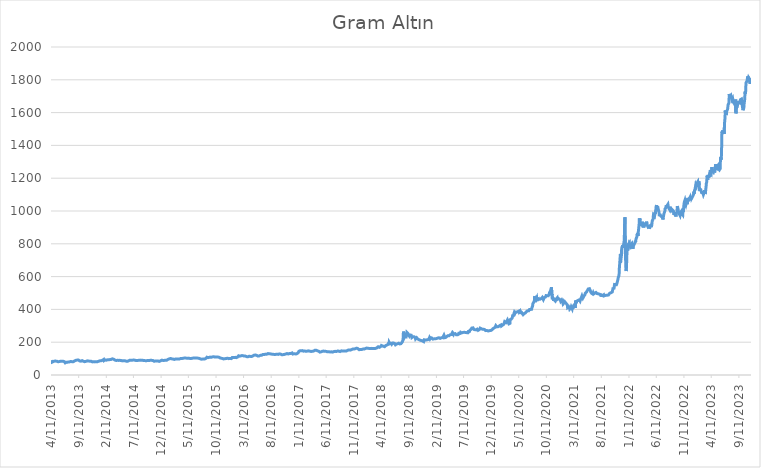
| Category | Açılış |
|---|---|
| 4/11/13 | 89.632 |
| 4/12/13 | 89.523 |
| 4/15/13 | 85.161 |
| 4/16/13 | 77.945 |
| 4/17/13 | 78.718 |
| 4/18/13 | 79.491 |
| 4/19/13 | 80.335 |
| 4/22/13 | 81.449 |
| 4/23/13 | 82.692 |
| 4/24/13 | 81.915 |
| 4/25/13 | 82.908 |
| 4/26/13 | 84.806 |
| 4/29/13 | 84.578 |
| 4/30/13 | 85.11 |
| 5/1/13 | 84.945 |
| 5/2/13 | 83.949 |
| 5/3/13 | 84.479 |
| 5/6/13 | 84.735 |
| 5/7/13 | 84.812 |
| 5/8/13 | 83.806 |
| 5/9/13 | 84.729 |
| 5/10/13 | 84.164 |
| 5/13/13 | 83.9 |
| 5/14/13 | 83.254 |
| 5/15/13 | 83.142 |
| 5/16/13 | 81.625 |
| 5/17/13 | 81.239 |
| 5/20/13 | 80.635 |
| 5/21/13 | 82.519 |
| 5/22/13 | 81.223 |
| 5/23/13 | 81.29 |
| 5/24/13 | 82.362 |
| 5/27/13 | 82.265 |
| 5/28/13 | 82.569 |
| 5/29/13 | 82.46 |
| 5/30/13 | 83.274 |
| 5/31/13 | 85.065 |
| 6/3/13 | 84.077 |
| 6/4/13 | 85.318 |
| 6/5/13 | 84.267 |
| 6/6/13 | 85.198 |
| 6/7/13 | 85.844 |
| 6/10/13 | 83.459 |
| 6/11/13 | 84.649 |
| 6/12/13 | 83.728 |
| 6/13/13 | 83.563 |
| 6/14/13 | 82.855 |
| 6/17/13 | 83.852 |
| 6/18/13 | 83.323 |
| 6/19/13 | 82.851 |
| 6/20/13 | 82.698 |
| 6/21/13 | 79.638 |
| 6/24/13 | 80.744 |
| 6/25/13 | 80.178 |
| 6/26/13 | 79.251 |
| 6/27/13 | 76.233 |
| 6/28/13 | 74.018 |
| 7/1/13 | 76.478 |
| 7/2/13 | 77.438 |
| 7/3/13 | 77.248 |
| 7/4/13 | 78.277 |
| 7/5/13 | 77.976 |
| 7/8/13 | 77.012 |
| 7/9/13 | 77.377 |
| 7/10/13 | 77.937 |
| 7/11/13 | 78.868 |
| 7/12/13 | 80.626 |
| 7/15/13 | 80.668 |
| 7/16/13 | 79.656 |
| 7/17/13 | 79.631 |
| 7/18/13 | 78.232 |
| 7/19/13 | 79.237 |
| 7/22/13 | 79.856 |
| 7/23/13 | 81.944 |
| 7/24/13 | 82.308 |
| 7/25/13 | 81.533 |
| 7/26/13 | 82.352 |
| 7/29/13 | 82.478 |
| 7/30/13 | 82.231 |
| 7/31/13 | 81.974 |
| 8/1/13 | 82.221 |
| 8/2/13 | 81.754 |
| 8/5/13 | 81.188 |
| 8/6/13 | 80.844 |
| 8/7/13 | 79.278 |
| 8/8/13 | 79.811 |
| 8/9/13 | 81.027 |
| 8/12/13 | 81.09 |
| 8/13/13 | 82.784 |
| 8/14/13 | 82.051 |
| 8/15/13 | 82.373 |
| 8/16/13 | 84.738 |
| 8/19/13 | 85.996 |
| 8/20/13 | 85.76 |
| 8/21/13 | 85.887 |
| 8/22/13 | 87.004 |
| 8/23/13 | 88.097 |
| 8/26/13 | 89.387 |
| 8/27/13 | 90.05 |
| 8/28/13 | 92.638 |
| 8/29/13 | 92.826 |
| 8/30/13 | 91.961 |
| 9/2/13 | 90.925 |
| 9/3/13 | 90.255 |
| 9/4/13 | 93.319 |
| 9/5/13 | 91.66 |
| 9/6/13 | 90.864 |
| 9/9/13 | 91.605 |
| 9/10/13 | 90.268 |
| 9/11/13 | 88.229 |
| 9/12/13 | 88.248 |
| 9/13/13 | 86.101 |
| 9/16/13 | 85.794 |
| 9/17/13 | 84.303 |
| 9/18/13 | 84.209 |
| 9/19/13 | 85.167 |
| 9/20/13 | 86.058 |
| 9/23/13 | 84.267 |
| 9/24/13 | 84.248 |
| 9/25/13 | 84.872 |
| 9/26/13 | 86.345 |
| 9/27/13 | 85.987 |
| 9/30/13 | 87.858 |
| 10/1/13 | 86.049 |
| 10/2/13 | 83.077 |
| 10/3/13 | 84.28 |
| 10/4/13 | 84.711 |
| 10/7/13 | 83.704 |
| 10/8/13 | 84.67 |
| 10/9/13 | 84.287 |
| 10/10/13 | 83.111 |
| 10/11/13 | 81.566 |
| 10/14/13 | 81.306 |
| 10/15/13 | 80.933 |
| 10/16/13 | 81.688 |
| 10/17/13 | 81.136 |
| 10/18/13 | 83.309 |
| 10/21/13 | 83.226 |
| 10/22/13 | 83.667 |
| 10/23/13 | 84.637 |
| 10/24/13 | 84.454 |
| 10/25/13 | 85.646 |
| 10/28/13 | 86.206 |
| 10/29/13 | 86.219 |
| 10/30/13 | 85.905 |
| 10/31/13 | 86.037 |
| 11/1/13 | 84.839 |
| 11/4/13 | 85.101 |
| 11/5/13 | 85.066 |
| 11/6/13 | 85.534 |
| 11/7/13 | 86.127 |
| 11/8/13 | 85.488 |
| 11/11/13 | 84.266 |
| 11/12/13 | 84.102 |
| 11/13/13 | 83.543 |
| 11/14/13 | 84.122 |
| 11/15/13 | 84.19 |
| 11/18/13 | 84.115 |
| 11/19/13 | 82.851 |
| 11/20/13 | 82.357 |
| 11/21/13 | 80.457 |
| 11/22/13 | 80.51 |
| 11/25/13 | 80.031 |
| 11/26/13 | 80.661 |
| 11/27/13 | 80.241 |
| 11/28/13 | 80.514 |
| 11/29/13 | 80.498 |
| 12/2/13 | 81.146 |
| 12/3/13 | 79.936 |
| 12/4/13 | 80.303 |
| 12/5/13 | 81.77 |
| 12/6/13 | 80.262 |
| 12/9/13 | 80.062 |
| 12/10/13 | 80.892 |
| 12/11/13 | 82.084 |
| 12/12/13 | 82.166 |
| 12/13/13 | 80.41 |
| 12/16/13 | 81.168 |
| 12/17/13 | 80.771 |
| 12/18/13 | 80.475 |
| 12/19/13 | 80.485 |
| 12/20/13 | 79.066 |
| 12/23/13 | 80.781 |
| 12/24/13 | 80.764 |
| 12/26/13 | 81.153 |
| 12/27/13 | 82.712 |
| 12/30/13 | 84.058 |
| 12/31/13 | 81.552 |
| 1/2/14 | 82.973 |
| 1/3/14 | 85.194 |
| 1/6/14 | 86.462 |
| 1/7/14 | 86.278 |
| 1/8/14 | 85.723 |
| 1/9/14 | 86.011 |
| 1/10/14 | 85.847 |
| 1/13/14 | 86.711 |
| 1/14/14 | 87.718 |
| 1/15/14 | 87.316 |
| 1/16/14 | 87.404 |
| 1/17/14 | 88.086 |
| 1/20/14 | 89.911 |
| 1/21/14 | 90.304 |
| 1/22/14 | 89.759 |
| 1/23/14 | 89.692 |
| 1/24/14 | 93.03 |
| 1/27/14 | 95.079 |
| 1/28/14 | 92.067 |
| 1/29/14 | 87.918 |
| 1/30/14 | 92.052 |
| 1/31/14 | 90.283 |
| 2/3/14 | 90.271 |
| 2/4/14 | 92.183 |
| 2/5/14 | 90.042 |
| 2/6/14 | 90.363 |
| 2/7/14 | 89.206 |
| 2/10/14 | 90.21 |
| 2/11/14 | 90.614 |
| 2/12/14 | 90.856 |
| 2/13/14 | 90.77 |
| 2/14/14 | 91.325 |
| 2/17/14 | 92.418 |
| 2/18/14 | 92.883 |
| 2/19/14 | 92.55 |
| 2/20/14 | 93.188 |
| 2/21/14 | 93.468 |
| 2/24/14 | 92.723 |
| 2/25/14 | 94.526 |
| 2/26/14 | 95.271 |
| 2/27/14 | 95.642 |
| 2/28/14 | 94.718 |
| 3/2/14 | 94.147 |
| 3/3/14 | 95.887 |
| 3/4/14 | 96.796 |
| 3/5/14 | 94.769 |
| 3/6/14 | 94.663 |
| 3/7/14 | 94.597 |
| 3/9/14 | 95.046 |
| 3/10/14 | 94.882 |
| 3/11/14 | 95.651 |
| 3/12/14 | 97.273 |
| 3/13/14 | 98.137 |
| 3/14/14 | 98.687 |
| 3/16/14 | 98.708 |
| 3/17/14 | 99.093 |
| 3/18/14 | 97.545 |
| 3/19/14 | 96.716 |
| 3/20/14 | 95.734 |
| 3/21/14 | 95.512 |
| 3/23/14 | 96.329 |
| 3/24/14 | 95.827 |
| 3/25/14 | 94.295 |
| 3/26/14 | 93.356 |
| 3/27/14 | 92.045 |
| 3/28/14 | 90.834 |
| 3/30/14 | 91.045 |
| 3/31/14 | 90.744 |
| 4/1/14 | 88.322 |
| 4/2/14 | 88.014 |
| 4/3/14 | 88.326 |
| 4/4/14 | 88.184 |
| 4/6/14 | 88.638 |
| 4/7/14 | 88.674 |
| 4/8/14 | 88.174 |
| 4/9/14 | 88.225 |
| 4/10/14 | 88.606 |
| 4/11/14 | 89.501 |
| 4/13/14 | 89.585 |
| 4/14/14 | 90.324 |
| 4/15/14 | 90.449 |
| 4/16/14 | 89.772 |
| 4/17/14 | 89.539 |
| 4/20/14 | 89.003 |
| 4/21/14 | 88.498 |
| 4/22/14 | 88.476 |
| 4/23/14 | 88.503 |
| 4/24/14 | 88.82 |
| 4/25/14 | 88.647 |
| 4/27/14 | 89.41 |
| 4/28/14 | 89.593 |
| 4/29/14 | 88.725 |
| 4/30/14 | 88.401 |
| 5/1/14 | 87.727 |
| 5/2/14 | 86.989 |
| 5/4/14 | 88.07 |
| 5/5/14 | 88.006 |
| 5/6/14 | 88.535 |
| 5/7/14 | 87.848 |
| 5/8/14 | 86.355 |
| 5/9/14 | 86.198 |
| 5/11/14 | 86.114 |
| 5/12/14 | 85.712 |
| 5/13/14 | 86.74 |
| 5/14/14 | 86.136 |
| 5/15/14 | 86.937 |
| 5/16/14 | 87.491 |
| 5/18/14 | 87.248 |
| 5/19/14 | 87.127 |
| 5/20/14 | 87.183 |
| 5/21/14 | 87.965 |
| 5/22/14 | 87.08 |
| 5/23/14 | 86.622 |
| 5/25/14 | 86.465 |
| 5/26/14 | 86.441 |
| 5/27/14 | 86.548 |
| 5/28/14 | 85.398 |
| 5/29/14 | 84.821 |
| 5/30/14 | 84.38 |
| 6/1/14 | 84.244 |
| 6/2/14 | 84.1 |
| 6/3/14 | 84.391 |
| 6/4/14 | 84.797 |
| 6/5/14 | 84.637 |
| 6/6/14 | 84.525 |
| 6/8/14 | 83.664 |
| 6/9/14 | 83.75 |
| 6/10/14 | 83.974 |
| 6/11/14 | 84.234 |
| 6/12/14 | 85.739 |
| 6/13/14 | 86.482 |
| 6/15/14 | 87.308 |
| 6/16/14 | 87.354 |
| 6/17/14 | 87.693 |
| 6/18/14 | 87.85 |
| 6/19/14 | 87.358 |
| 6/20/14 | 90.531 |
| 6/22/14 | 90.635 |
| 6/23/14 | 90.681 |
| 6/24/14 | 90.25 |
| 6/25/14 | 90.814 |
| 6/26/14 | 90.358 |
| 6/27/14 | 89.952 |
| 6/29/14 | 89.852 |
| 6/30/14 | 89.818 |
| 7/1/14 | 90.343 |
| 7/2/14 | 90.729 |
| 7/3/14 | 90.785 |
| 7/4/14 | 90.318 |
| 7/6/14 | 90.59 |
| 7/7/14 | 90.351 |
| 7/8/14 | 90.239 |
| 7/9/14 | 90.059 |
| 7/10/14 | 90.269 |
| 7/11/14 | 91.225 |
| 7/13/14 | 91.253 |
| 7/14/14 | 91.268 |
| 7/15/14 | 89.092 |
| 7/16/14 | 88.442 |
| 7/17/14 | 88.609 |
| 7/18/14 | 90.845 |
| 7/20/14 | 89.58 |
| 7/21/14 | 89.561 |
| 7/22/14 | 89.317 |
| 7/23/14 | 88.599 |
| 7/24/14 | 87.555 |
| 7/25/14 | 86.988 |
| 7/27/14 | 87.967 |
| 7/28/14 | 87.926 |
| 7/29/14 | 88.012 |
| 7/30/14 | 88.339 |
| 7/31/14 | 88.907 |
| 8/1/14 | 88.354 |
| 8/3/14 | 88.676 |
| 8/4/14 | 88.718 |
| 8/5/14 | 88.251 |
| 8/6/14 | 89.182 |
| 8/7/14 | 90.702 |
| 8/8/14 | 91.468 |
| 8/11/14 | 89.862 |
| 8/12/14 | 90.402 |
| 8/13/14 | 91.055 |
| 8/14/14 | 90.927 |
| 8/15/14 | 90.906 |
| 8/17/14 | 90.726 |
| 8/18/14 | 90.737 |
| 8/19/14 | 90.302 |
| 8/20/14 | 90.075 |
| 8/21/14 | 90.595 |
| 8/22/14 | 89.476 |
| 8/24/14 | 89.602 |
| 8/25/14 | 89.563 |
| 8/26/14 | 89.416 |
| 8/27/14 | 89.206 |
| 8/28/14 | 88.913 |
| 8/29/14 | 89.65 |
| 8/31/14 | 89.455 |
| 9/1/14 | 89.407 |
| 9/2/14 | 89.326 |
| 9/3/14 | 88.527 |
| 9/4/14 | 88.123 |
| 9/5/14 | 87.587 |
| 9/7/14 | 88.042 |
| 9/8/14 | 87.93 |
| 9/9/14 | 87.768 |
| 9/10/14 | 88.617 |
| 9/11/14 | 88.058 |
| 9/12/14 | 87.746 |
| 9/14/14 | 87.49 |
| 9/15/14 | 87.746 |
| 9/16/14 | 87.794 |
| 9/17/14 | 87.521 |
| 9/18/14 | 87.37 |
| 9/19/14 | 87.645 |
| 9/21/14 | 87.383 |
| 9/22/14 | 87.399 |
| 9/23/14 | 87.54 |
| 9/24/14 | 87.914 |
| 9/25/14 | 87.472 |
| 9/26/14 | 88.882 |
| 9/28/14 | 88.71 |
| 9/29/14 | 88.589 |
| 9/30/14 | 89.171 |
| 10/1/14 | 88.508 |
| 10/2/14 | 89.23 |
| 10/3/14 | 88.467 |
| 10/5/14 | 87.777 |
| 10/6/14 | 87.497 |
| 10/7/14 | 88.003 |
| 10/8/14 | 88.532 |
| 10/9/14 | 88.762 |
| 10/10/14 | 89.328 |
| 10/12/14 | 89.962 |
| 10/13/14 | 90.461 |
| 10/14/14 | 90.223 |
| 10/15/14 | 89.869 |
| 10/16/14 | 90.565 |
| 10/17/14 | 90.077 |
| 10/19/14 | 89.425 |
| 10/20/14 | 89.18 |
| 10/21/14 | 89.868 |
| 10/22/14 | 90.113 |
| 10/23/14 | 89.753 |
| 10/24/14 | 88.523 |
| 10/26/14 | 88.295 |
| 10/27/14 | 88.145 |
| 10/28/14 | 87.918 |
| 10/29/14 | 87.225 |
| 10/30/14 | 86.386 |
| 10/31/14 | 84.865 |
| 11/2/14 | 83.881 |
| 11/3/14 | 83.544 |
| 11/4/14 | 83.718 |
| 11/5/14 | 83.518 |
| 11/6/14 | 82.551 |
| 11/7/14 | 83.115 |
| 11/9/14 | 85.347 |
| 11/10/14 | 84.962 |
| 11/11/14 | 83.931 |
| 11/12/14 | 84.298 |
| 11/13/14 | 83.895 |
| 11/14/14 | 83.703 |
| 11/16/14 | 84.976 |
| 11/17/14 | 84.785 |
| 11/18/14 | 85.111 |
| 11/19/14 | 85.348 |
| 11/20/14 | 84.889 |
| 11/21/14 | 85.217 |
| 11/23/14 | 85.85 |
| 11/24/14 | 85.869 |
| 11/25/14 | 85.855 |
| 11/26/14 | 85.732 |
| 11/27/14 | 85.126 |
| 11/28/14 | 84.407 |
| 11/30/14 | 82.839 |
| 12/1/14 | 82.223 |
| 12/2/14 | 85.891 |
| 12/3/14 | 85.92 |
| 12/4/14 | 87.032 |
| 12/5/14 | 86.545 |
| 12/7/14 | 86.479 |
| 12/8/14 | 86.405 |
| 12/9/14 | 87.734 |
| 12/10/14 | 89.566 |
| 12/11/14 | 89.561 |
| 12/12/14 | 89.911 |
| 12/14/14 | 90.575 |
| 12/15/14 | 90.523 |
| 12/16/14 | 90.795 |
| 12/17/14 | 90.997 |
| 12/18/14 | 89.461 |
| 12/19/14 | 89.422 |
| 12/21/14 | 88.849 |
| 12/22/14 | 88.959 |
| 12/23/14 | 87.372 |
| 12/24/14 | 87.948 |
| 12/25/14 | 87.779 |
| 12/26/14 | 87.762 |
| 12/28/14 | 89.146 |
| 12/29/14 | 89.069 |
| 12/30/14 | 88.095 |
| 12/31/14 | 89.747 |
| 1/1/15 | 88.858 |
| 1/2/15 | 89.038 |
| 1/4/15 | 89.461 |
| 1/5/15 | 89.241 |
| 1/6/15 | 90.204 |
| 1/7/15 | 90.958 |
| 1/8/15 | 90.397 |
| 1/9/15 | 89.32 |
| 1/11/15 | 90.287 |
| 1/12/15 | 90.424 |
| 1/13/15 | 90.471 |
| 1/14/15 | 90.537 |
| 1/15/15 | 90.343 |
| 1/16/15 | 93.661 |
| 1/18/15 | 95.585 |
| 1/19/15 | 95.928 |
| 1/20/15 | 95.723 |
| 1/21/15 | 97.537 |
| 1/22/15 | 97.59 |
| 1/23/15 | 97.338 |
| 1/25/15 | 98.314 |
| 1/26/15 | 98.577 |
| 1/27/15 | 96.997 |
| 1/28/15 | 98.35 |
| 1/29/15 | 98.663 |
| 1/30/15 | 97.982 |
| 2/1/15 | 100.73 |
| 2/2/15 | 100.629 |
| 2/3/15 | 99.664 |
| 2/4/15 | 97.458 |
| 2/5/15 | 100.662 |
| 2/6/15 | 99.18 |
| 2/8/15 | 98.384 |
| 2/9/15 | 98.425 |
| 2/10/15 | 98.625 |
| 2/11/15 | 99.009 |
| 2/12/15 | 98.086 |
| 2/13/15 | 97.116 |
| 2/15/15 | 97.051 |
| 2/16/15 | 97.102 |
| 2/17/15 | 97.259 |
| 2/18/15 | 95.398 |
| 2/19/15 | 95.352 |
| 2/20/15 | 95.436 |
| 2/22/15 | 95.104 |
| 2/23/15 | 94.986 |
| 2/24/15 | 95.715 |
| 2/25/15 | 95.472 |
| 2/26/15 | 96.437 |
| 2/27/15 | 97.506 |
| 3/1/15 | 97.851 |
| 3/2/15 | 97.872 |
| 3/3/15 | 97.874 |
| 3/4/15 | 98.193 |
| 3/5/15 | 99.141 |
| 3/6/15 | 100.624 |
| 3/8/15 | 98.317 |
| 3/9/15 | 98.721 |
| 3/10/15 | 97.666 |
| 3/11/15 | 98.67 |
| 3/12/15 | 97.096 |
| 3/13/15 | 96.027 |
| 3/15/15 | 98.321 |
| 3/16/15 | 98.119 |
| 3/17/15 | 97.576 |
| 3/18/15 | 96.635 |
| 3/19/15 | 96.935 |
| 3/20/15 | 98.123 |
| 3/22/15 | 97.874 |
| 3/23/15 | 98.405 |
| 3/24/15 | 97.244 |
| 3/25/15 | 97.989 |
| 3/26/15 | 99.401 |
| 3/27/15 | 100.79 |
| 3/29/15 | 100.654 |
| 3/30/15 | 100.593 |
| 3/31/15 | 99.386 |
| 4/1/15 | 98.91 |
| 4/2/15 | 100.602 |
| 4/5/15 | 100.403 |
| 4/6/15 | 100.513 |
| 4/7/15 | 100.449 |
| 4/8/15 | 101.126 |
| 4/9/15 | 100.382 |
| 4/10/15 | 100.641 |
| 4/12/15 | 102.062 |
| 4/13/15 | 102.077 |
| 4/14/15 | 102.911 |
| 4/15/15 | 103.164 |
| 4/16/15 | 104.518 |
| 4/17/15 | 103.406 |
| 4/19/15 | 103.735 |
| 4/20/15 | 104.008 |
| 4/21/15 | 103.718 |
| 4/22/15 | 103.771 |
| 4/23/15 | 103.771 |
| 4/24/15 | 103.771 |
| 4/26/15 | 103.052 |
| 4/27/15 | 103.221 |
| 4/28/15 | 103.345 |
| 4/29/15 | 103.593 |
| 4/30/15 | 103.041 |
| 5/1/15 | 101.896 |
| 5/3/15 | 102.584 |
| 5/4/15 | 102.794 |
| 5/5/15 | 103.728 |
| 5/6/15 | 104.032 |
| 5/7/15 | 103.123 |
| 5/8/15 | 102.415 |
| 5/10/15 | 102.927 |
| 5/11/15 | 102.971 |
| 5/12/15 | 102.512 |
| 5/13/15 | 102.042 |
| 5/14/15 | 102.667 |
| 5/15/15 | 101.785 |
| 5/17/15 | 101.418 |
| 5/18/15 | 101.426 |
| 5/19/15 | 101.668 |
| 5/20/15 | 100.944 |
| 5/21/15 | 100.36 |
| 5/22/15 | 100.512 |
| 5/24/15 | 100.696 |
| 5/25/15 | 100.706 |
| 5/26/15 | 101.521 |
| 5/27/15 | 100.851 |
| 5/28/15 | 100.89 |
| 5/29/15 | 101.558 |
| 5/31/15 | 101.946 |
| 6/1/15 | 101.944 |
| 6/2/15 | 102.574 |
| 6/3/15 | 102.595 |
| 6/4/15 | 102.391 |
| 6/5/15 | 101.118 |
| 6/7/15 | 103.613 |
| 6/8/15 | 103.775 |
| 6/9/15 | 103.825 |
| 6/10/15 | 104.186 |
| 6/11/15 | 104.291 |
| 6/12/15 | 102.719 |
| 6/14/15 | 103.16 |
| 6/15/15 | 103.458 |
| 6/16/15 | 104.338 |
| 6/17/15 | 103.914 |
| 6/18/15 | 103.354 |
| 6/19/15 | 104.821 |
| 6/21/15 | 103.913 |
| 6/22/15 | 103.894 |
| 6/23/15 | 101.701 |
| 6/24/15 | 101.474 |
| 6/25/15 | 101.229 |
| 6/26/15 | 100.264 |
| 6/28/15 | 103.208 |
| 6/29/15 | 102.961 |
| 6/30/15 | 102.592 |
| 7/1/15 | 101.155 |
| 7/2/15 | 101.138 |
| 7/3/15 | 100.693 |
| 7/5/15 | 102.462 |
| 7/6/15 | 102.468 |
| 7/7/15 | 100.803 |
| 7/8/15 | 99.756 |
| 7/9/15 | 99.899 |
| 7/10/15 | 99.636 |
| 7/12/15 | 99.989 |
| 7/13/15 | 99.848 |
| 7/14/15 | 98.461 |
| 7/15/15 | 97.863 |
| 7/16/15 | 97.733 |
| 7/17/15 | 97.82 |
| 7/19/15 | 96.804 |
| 7/20/15 | 96.755 |
| 7/21/15 | 95.254 |
| 7/22/15 | 94.896 |
| 7/23/15 | 95.298 |
| 7/24/15 | 95.935 |
| 7/26/15 | 96.749 |
| 7/27/15 | 96.928 |
| 7/28/15 | 97.395 |
| 7/29/15 | 97.226 |
| 7/30/15 | 97.636 |
| 7/31/15 | 97.552 |
| 8/2/15 | 97.463 |
| 8/3/15 | 97.316 |
| 8/4/15 | 96.887 |
| 8/5/15 | 97.084 |
| 8/6/15 | 97.218 |
| 8/7/15 | 97.248 |
| 8/9/15 | 97.726 |
| 8/10/15 | 97.647 |
| 8/11/15 | 98.417 |
| 8/12/15 | 99.083 |
| 8/13/15 | 100.397 |
| 8/14/15 | 101.193 |
| 8/16/15 | 101.526 |
| 8/17/15 | 101.571 |
| 8/18/15 | 103.016 |
| 8/19/15 | 104.012 |
| 8/20/15 | 106.709 |
| 8/21/15 | 108.426 |
| 8/23/15 | 109.153 |
| 8/24/15 | 110.495 |
| 8/25/15 | 109.384 |
| 8/26/15 | 108.469 |
| 8/27/15 | 105.879 |
| 8/28/15 | 105.47 |
| 8/30/15 | 106.36 |
| 8/31/15 | 106.293 |
| 9/1/15 | 106.422 |
| 9/2/15 | 107.433 |
| 9/3/15 | 107.211 |
| 9/4/15 | 107.589 |
| 9/6/15 | 109.141 |
| 9/7/15 | 109.513 |
| 9/8/15 | 109.255 |
| 9/9/15 | 108.722 |
| 9/10/15 | 108.557 |
| 9/11/15 | 107.93 |
| 9/13/15 | 108.736 |
| 9/14/15 | 108.063 |
| 9/15/15 | 109.079 |
| 9/16/15 | 107.718 |
| 9/17/15 | 108.002 |
| 9/18/15 | 109.39 |
| 9/20/15 | 110.255 |
| 9/21/15 | 109.954 |
| 9/22/15 | 109.394 |
| 9/23/15 | 109.452 |
| 9/24/15 | 110.662 |
| 9/25/15 | 112.715 |
| 9/27/15 | 111.822 |
| 9/28/15 | 112.42 |
| 9/29/15 | 111.296 |
| 9/30/15 | 110.015 |
| 10/1/15 | 108.477 |
| 10/2/15 | 108.406 |
| 10/4/15 | 109.527 |
| 10/5/15 | 109.597 |
| 10/6/15 | 108.931 |
| 10/7/15 | 109.045 |
| 10/8/15 | 108.258 |
| 10/9/15 | 106.132 |
| 10/11/15 | 109.851 |
| 10/12/15 | 109.054 |
| 10/13/15 | 109.41 |
| 10/14/15 | 111.191 |
| 10/15/15 | 110.993 |
| 10/16/15 | 109.554 |
| 10/18/15 | 109.543 |
| 10/19/15 | 109.666 |
| 10/20/15 | 109.218 |
| 10/21/15 | 109.808 |
| 10/22/15 | 108.552 |
| 10/23/15 | 107.686 |
| 10/26/15 | 108.667 |
| 10/27/15 | 108.166 |
| 10/28/15 | 108.959 |
| 10/29/15 | 108.822 |
| 10/30/15 | 108.347 |
| 11/1/15 | 104.454 |
| 11/2/15 | 104.435 |
| 11/3/15 | 102.918 |
| 11/4/15 | 101.889 |
| 11/5/15 | 102.205 |
| 11/6/15 | 101.747 |
| 11/8/15 | 102.384 |
| 11/9/15 | 102.456 |
| 11/10/15 | 102.628 |
| 11/11/15 | 102.169 |
| 11/12/15 | 100.421 |
| 11/13/15 | 99.854 |
| 11/15/15 | 100.519 |
| 11/16/15 | 100.797 |
| 11/17/15 | 100.444 |
| 11/18/15 | 98.668 |
| 11/19/15 | 98.6 |
| 11/20/15 | 98.929 |
| 11/22/15 | 98.025 |
| 11/23/15 | 97.952 |
| 11/24/15 | 98.099 |
| 11/25/15 | 99.443 |
| 11/26/15 | 99.406 |
| 11/27/15 | 100.952 |
| 11/29/15 | 99.461 |
| 11/30/15 | 99.513 |
| 12/1/15 | 99.643 |
| 12/2/15 | 99.416 |
| 12/3/15 | 97.905 |
| 12/4/15 | 98.596 |
| 12/6/15 | 100.826 |
| 12/7/15 | 100.738 |
| 12/8/15 | 100.303 |
| 12/9/15 | 100.71 |
| 12/10/15 | 100.437 |
| 12/11/15 | 100.827 |
| 12/13/15 | 102.282 |
| 12/14/15 | 102.382 |
| 12/15/15 | 101.901 |
| 12/16/15 | 101.15 |
| 12/17/15 | 101.017 |
| 12/18/15 | 99.112 |
| 12/20/15 | 99.79 |
| 12/21/15 | 99.734 |
| 12/22/15 | 100.896 |
| 12/23/15 | 101.182 |
| 12/24/15 | 100.641 |
| 12/27/15 | 100.87 |
| 12/28/15 | 100.876 |
| 12/29/15 | 99.814 |
| 12/30/15 | 99.939 |
| 12/31/15 | 99.78 |
| 1/3/16 | 99.98 |
| 1/4/16 | 99.833 |
| 1/5/16 | 102.321 |
| 1/6/16 | 103.504 |
| 1/7/16 | 105.524 |
| 1/8/16 | 107.05 |
| 1/10/16 | 108.206 |
| 1/11/16 | 108.074 |
| 1/12/16 | 107.052 |
| 1/13/16 | 105.995 |
| 1/14/16 | 106.631 |
| 1/15/16 | 104.781 |
| 1/17/16 | 106.999 |
| 1/18/16 | 106.892 |
| 1/19/16 | 106.287 |
| 1/20/16 | 106.274 |
| 1/21/16 | 107.494 |
| 1/22/16 | 106.82 |
| 1/24/16 | 105.965 |
| 1/25/16 | 106.095 |
| 1/26/16 | 107.718 |
| 1/27/16 | 108.292 |
| 1/28/16 | 108.57 |
| 1/29/16 | 106.452 |
| 1/31/16 | 106.124 |
| 2/1/16 | 106.215 |
| 2/2/16 | 106.928 |
| 2/3/16 | 107.095 |
| 2/4/16 | 107.051 |
| 2/5/16 | 108.262 |
| 2/7/16 | 109.904 |
| 2/8/16 | 109.312 |
| 2/9/16 | 112.848 |
| 2/10/16 | 112.438 |
| 2/11/16 | 112.553 |
| 2/12/16 | 116.978 |
| 2/14/16 | 116.393 |
| 2/15/16 | 116.463 |
| 2/16/16 | 114.565 |
| 2/17/16 | 115.195 |
| 2/18/16 | 114.74 |
| 2/19/16 | 117.469 |
| 2/21/16 | 116.404 |
| 2/22/16 | 116.342 |
| 2/23/16 | 114.179 |
| 2/24/16 | 116.413 |
| 2/25/16 | 115.596 |
| 2/26/16 | 116.175 |
| 2/28/16 | 117.102 |
| 2/29/16 | 117.421 |
| 3/1/16 | 118.201 |
| 3/2/16 | 116.354 |
| 3/3/16 | 116.734 |
| 3/4/16 | 117.933 |
| 3/6/16 | 117.917 |
| 3/7/16 | 118.079 |
| 3/8/16 | 118.927 |
| 3/9/16 | 118.322 |
| 3/10/16 | 116.645 |
| 3/11/16 | 118.216 |
| 3/13/16 | 115.757 |
| 3/14/16 | 115.734 |
| 3/15/16 | 114.126 |
| 3/16/16 | 114.885 |
| 3/17/16 | 116.202 |
| 3/18/16 | 115.176 |
| 3/20/16 | 115.64 |
| 3/21/16 | 115.695 |
| 3/22/16 | 114.516 |
| 3/23/16 | 115.103 |
| 3/24/16 | 113.068 |
| 3/27/16 | 112.271 |
| 3/28/16 | 112.262 |
| 3/29/16 | 112.785 |
| 3/30/16 | 113.21 |
| 3/31/16 | 111.844 |
| 4/1/16 | 111.568 |
| 4/3/16 | 110.896 |
| 4/4/16 | 110.842 |
| 4/5/16 | 109.884 |
| 4/6/16 | 112.076 |
| 4/7/16 | 111.885 |
| 4/8/16 | 114.077 |
| 4/10/16 | 114.076 |
| 4/11/16 | 114.091 |
| 4/12/16 | 114.418 |
| 4/13/16 | 114.341 |
| 4/14/16 | 113.541 |
| 4/15/16 | 112.698 |
| 4/17/16 | 113.514 |
| 4/18/16 | 113.569 |
| 4/19/16 | 112.271 |
| 4/20/16 | 113.769 |
| 4/21/16 | 112.626 |
| 4/22/16 | 113.756 |
| 4/24/16 | 112.896 |
| 4/25/16 | 112.922 |
| 4/26/16 | 113.229 |
| 4/27/16 | 112.777 |
| 4/28/16 | 112.942 |
| 4/29/16 | 114.482 |
| 5/1/16 | 116.349 |
| 5/2/16 | 116.356 |
| 5/3/16 | 116.323 |
| 5/4/16 | 117.759 |
| 5/5/16 | 121.908 |
| 5/6/16 | 120.282 |
| 5/8/16 | 120.916 |
| 5/9/16 | 120.955 |
| 5/10/16 | 119.508 |
| 5/11/16 | 119.973 |
| 5/12/16 | 121.331 |
| 5/13/16 | 120.672 |
| 5/15/16 | 121.687 |
| 5/16/16 | 121.768 |
| 5/17/16 | 121.971 |
| 5/18/16 | 122.106 |
| 5/19/16 | 121.115 |
| 5/20/16 | 120.767 |
| 5/22/16 | 119.755 |
| 5/23/16 | 119.857 |
| 5/24/16 | 120.339 |
| 5/25/16 | 116.176 |
| 5/26/16 | 115.75 |
| 5/27/16 | 115.439 |
| 5/29/16 | 115.299 |
| 5/30/16 | 114.991 |
| 5/31/16 | 114.971 |
| 6/1/16 | 115.362 |
| 6/2/16 | 114.82 |
| 6/3/16 | 114.542 |
| 6/5/16 | 116.419 |
| 6/6/16 | 116.727 |
| 6/7/16 | 116.347 |
| 6/8/16 | 115.875 |
| 6/9/16 | 117.606 |
| 6/10/16 | 117.851 |
| 6/12/16 | 120.181 |
| 6/13/16 | 120.406 |
| 6/14/16 | 120.531 |
| 6/15/16 | 121.249 |
| 6/16/16 | 121.578 |
| 6/17/16 | 120.756 |
| 6/19/16 | 120.77 |
| 6/20/16 | 120.767 |
| 6/21/16 | 120.225 |
| 6/22/16 | 118.843 |
| 6/23/16 | 117.328 |
| 6/24/16 | 116.919 |
| 6/26/16 | 125.309 |
| 6/27/16 | 126.094 |
| 6/28/16 | 125.101 |
| 6/29/16 | 122.816 |
| 6/30/16 | 122.325 |
| 7/1/16 | 122.505 |
| 7/3/16 | 124.905 |
| 7/4/16 | 125.304 |
| 7/5/16 | 126.125 |
| 7/6/16 | 128.269 |
| 7/7/16 | 129.103 |
| 7/8/16 | 128.517 |
| 7/10/16 | 127.244 |
| 7/11/16 | 127.507 |
| 7/12/16 | 126.493 |
| 7/13/16 | 123.883 |
| 7/14/16 | 125.504 |
| 7/15/16 | 123.857 |
| 7/17/16 | 126.852 |
| 7/18/16 | 127.156 |
| 7/19/16 | 127.382 |
| 7/20/16 | 130.513 |
| 7/21/16 | 130.351 |
| 7/22/16 | 131.399 |
| 7/24/16 | 130.566 |
| 7/25/16 | 130.125 |
| 7/26/16 | 128.51 |
| 7/27/16 | 128.99 |
| 7/28/16 | 129.904 |
| 7/29/16 | 129.471 |
| 7/31/16 | 129.723 |
| 8/1/16 | 129.555 |
| 8/2/16 | 130.059 |
| 8/3/16 | 131.205 |
| 8/4/16 | 131.415 |
| 8/5/16 | 131.728 |
| 8/7/16 | 128.645 |
| 8/8/16 | 128.485 |
| 8/9/16 | 128.072 |
| 8/10/16 | 128.099 |
| 8/11/16 | 128.133 |
| 8/12/16 | 127.463 |
| 8/14/16 | 127.124 |
| 8/15/16 | 127.413 |
| 8/16/16 | 126.889 |
| 8/17/16 | 126.938 |
| 8/18/16 | 126.936 |
| 8/19/16 | 127.111 |
| 8/21/16 | 126.042 |
| 8/22/16 | 126.178 |
| 8/23/16 | 126.518 |
| 8/24/16 | 126.884 |
| 8/25/16 | 125.829 |
| 8/26/16 | 124.762 |
| 8/28/16 | 125.446 |
| 8/29/16 | 125.482 |
| 8/30/16 | 125.661 |
| 8/31/16 | 125.054 |
| 9/1/16 | 124.547 |
| 9/2/16 | 125.196 |
| 9/4/16 | 125.713 |
| 9/5/16 | 125.526 |
| 9/6/16 | 125.745 |
| 9/7/16 | 126.812 |
| 9/8/16 | 126.886 |
| 9/9/16 | 127.031 |
| 9/11/16 | 126.918 |
| 9/12/16 | 126.931 |
| 9/13/16 | 127.059 |
| 9/14/16 | 126.736 |
| 9/15/16 | 126.764 |
| 9/16/16 | 125.666 |
| 9/18/16 | 125.646 |
| 9/19/16 | 125.575 |
| 9/20/16 | 125.739 |
| 9/21/16 | 125.981 |
| 9/22/16 | 126.701 |
| 9/23/16 | 126.517 |
| 9/25/16 | 128.614 |
| 9/26/16 | 128.621 |
| 9/27/16 | 128.204 |
| 9/28/16 | 126.877 |
| 9/29/16 | 126.774 |
| 9/30/16 | 127.457 |
| 10/2/16 | 127.143 |
| 10/3/16 | 126.989 |
| 10/4/16 | 127.4 |
| 10/5/16 | 124.798 |
| 10/6/16 | 124.597 |
| 10/7/16 | 122.839 |
| 10/9/16 | 123.228 |
| 10/10/16 | 123.573 |
| 10/11/16 | 124.274 |
| 10/12/16 | 124.351 |
| 10/13/16 | 124.431 |
| 10/14/16 | 124.68 |
| 10/16/16 | 124.239 |
| 10/17/16 | 124.63 |
| 10/18/16 | 125.026 |
| 10/19/16 | 125.765 |
| 10/20/16 | 124.963 |
| 10/21/16 | 124.486 |
| 10/23/16 | 125.673 |
| 10/24/16 | 125.471 |
| 10/25/16 | 125.222 |
| 10/26/16 | 125.852 |
| 10/27/16 | 125.502 |
| 10/28/16 | 127.042 |
| 10/30/16 | 128.002 |
| 10/31/16 | 127.877 |
| 11/1/16 | 127.067 |
| 11/2/16 | 128.962 |
| 11/3/16 | 129.978 |
| 11/4/16 | 130.462 |
| 11/6/16 | 131.05 |
| 11/7/16 | 130.68 |
| 11/8/16 | 130.666 |
| 11/9/16 | 129.523 |
| 11/10/16 | 131.731 |
| 11/11/16 | 131.732 |
| 11/13/16 | 128.287 |
| 11/14/16 | 128.269 |
| 11/15/16 | 129.476 |
| 11/16/16 | 129.74 |
| 11/17/16 | 130.957 |
| 11/18/16 | 131.862 |
| 11/20/16 | 131.067 |
| 11/21/16 | 131.099 |
| 11/22/16 | 131.296 |
| 11/23/16 | 131.938 |
| 11/24/16 | 129.942 |
| 11/25/16 | 132.129 |
| 11/27/16 | 131.397 |
| 11/28/16 | 131.712 |
| 11/29/16 | 131.053 |
| 11/30/16 | 130.364 |
| 12/1/16 | 129.556 |
| 12/2/16 | 132.077 |
| 12/4/16 | 134.56 |
| 12/5/16 | 134.543 |
| 12/6/16 | 132.585 |
| 12/7/16 | 129.56 |
| 12/8/16 | 128.061 |
| 12/9/16 | 129.947 |
| 12/11/16 | 130.058 |
| 12/12/16 | 130.81 |
| 12/13/16 | 129.89 |
| 12/14/16 | 130.028 |
| 12/15/16 | 129.974 |
| 12/16/16 | 127.279 |
| 12/18/16 | 127.695 |
| 12/19/16 | 127.793 |
| 12/20/16 | 129.373 |
| 12/21/16 | 128.228 |
| 12/22/16 | 127.647 |
| 12/23/16 | 127.404 |
| 12/26/16 | 128.129 |
| 12/27/16 | 127.988 |
| 12/28/16 | 129.049 |
| 12/29/16 | 129.959 |
| 12/30/16 | 131.245 |
| 1/2/17 | 131.358 |
| 1/3/17 | 131.046 |
| 1/4/17 | 133.667 |
| 1/5/17 | 133.87 |
| 1/6/17 | 136.454 |
| 1/8/17 | 137.427 |
| 1/9/17 | 137.526 |
| 1/10/17 | 141.199 |
| 1/11/17 | 144.882 |
| 1/12/17 | 148.681 |
| 1/13/17 | 144.763 |
| 1/15/17 | 143.983 |
| 1/16/17 | 144.688 |
| 1/17/17 | 147.436 |
| 1/18/17 | 146.995 |
| 1/19/17 | 147.264 |
| 1/20/17 | 148.197 |
| 1/22/17 | 146.83 |
| 1/23/17 | 147.392 |
| 1/24/17 | 147.005 |
| 1/25/17 | 147.125 |
| 1/26/17 | 148.005 |
| 1/27/17 | 147.526 |
| 1/29/17 | 148.817 |
| 1/30/17 | 148.559 |
| 1/31/17 | 145.384 |
| 2/1/17 | 147.012 |
| 2/2/17 | 146.764 |
| 2/3/17 | 146.041 |
| 2/5/17 | 145.453 |
| 2/6/17 | 145.468 |
| 2/7/17 | 146.279 |
| 2/8/17 | 148.278 |
| 2/9/17 | 147.958 |
| 2/10/17 | 145.288 |
| 2/12/17 | 146.236 |
| 2/13/17 | 146.103 |
| 2/14/17 | 144.795 |
| 2/15/17 | 144.295 |
| 2/16/17 | 145.022 |
| 2/17/17 | 146.012 |
| 2/19/17 | 144.548 |
| 2/20/17 | 144.339 |
| 2/21/17 | 144.189 |
| 2/22/17 | 144.015 |
| 2/23/17 | 142.517 |
| 2/24/17 | 143.379 |
| 2/26/17 | 145.617 |
| 2/27/17 | 145.407 |
| 2/28/17 | 145.398 |
| 3/1/17 | 145.993 |
| 3/2/17 | 146.439 |
| 3/3/17 | 148.09 |
| 3/5/17 | 147.247 |
| 3/6/17 | 147.674 |
| 3/7/17 | 146.466 |
| 3/8/17 | 143.899 |
| 3/9/17 | 145.553 |
| 3/10/17 | 145.588 |
| 3/12/17 | 145.284 |
| 3/13/17 | 145.078 |
| 3/14/17 | 144.676 |
| 3/15/17 | 144.411 |
| 3/16/17 | 144.222 |
| 3/17/17 | 143.095 |
| 3/19/17 | 143.491 |
| 3/20/17 | 143.716 |
| 3/21/17 | 143.884 |
| 3/22/17 | 145.572 |
| 3/23/17 | 144.868 |
| 3/24/17 | 145.543 |
| 3/26/17 | 144.681 |
| 3/27/17 | 145.09 |
| 3/28/17 | 145.685 |
| 3/29/17 | 147.052 |
| 3/30/17 | 146.796 |
| 3/31/17 | 146.167 |
| 4/2/17 | 145.817 |
| 4/3/17 | 145.853 |
| 4/4/17 | 147.175 |
| 4/5/17 | 148.492 |
| 4/6/17 | 149.959 |
| 4/7/17 | 149.242 |
| 4/9/17 | 150.476 |
| 4/10/17 | 150.46 |
| 4/11/17 | 150.609 |
| 4/12/17 | 151.672 |
| 4/13/17 | 151.013 |
| 4/16/17 | 151.016 |
| 4/17/17 | 151.375 |
| 4/18/17 | 152.748 |
| 4/19/17 | 151.615 |
| 4/20/17 | 151.154 |
| 4/21/17 | 150.006 |
| 4/23/17 | 147.678 |
| 4/24/17 | 148.042 |
| 4/25/17 | 146.929 |
| 4/26/17 | 145.501 |
| 4/27/17 | 145.599 |
| 4/28/17 | 144.857 |
| 4/30/17 | 144.952 |
| 5/1/17 | 145.139 |
| 5/2/17 | 143.611 |
| 5/3/17 | 142.383 |
| 5/4/17 | 140.759 |
| 5/5/17 | 141.512 |
| 5/7/17 | 139.608 |
| 5/8/17 | 140.588 |
| 5/9/17 | 141.556 |
| 5/10/17 | 142.555 |
| 5/11/17 | 140.377 |
| 5/12/17 | 140.916 |
| 5/14/17 | 141.325 |
| 5/15/17 | 141.291 |
| 5/16/17 | 140.468 |
| 5/17/17 | 141.636 |
| 5/18/17 | 145.329 |
| 5/19/17 | 145.49 |
| 5/21/17 | 145.056 |
| 5/22/17 | 144.749 |
| 5/23/17 | 144.825 |
| 5/24/17 | 143.846 |
| 5/25/17 | 143.934 |
| 5/26/17 | 144.005 |
| 5/28/17 | 145.735 |
| 5/29/17 | 145.921 |
| 5/30/17 | 145.823 |
| 5/31/17 | 144.235 |
| 6/1/17 | 143.975 |
| 6/2/17 | 143.573 |
| 6/4/17 | 144.262 |
| 6/5/17 | 144.312 |
| 6/6/17 | 145.097 |
| 6/7/17 | 146.19 |
| 6/8/17 | 146.68 |
| 6/9/17 | 145.353 |
| 6/11/17 | 143.983 |
| 6/12/17 | 144.329 |
| 6/13/17 | 143.064 |
| 6/14/17 | 143.392 |
| 6/15/17 | 141.72 |
| 6/16/17 | 141.76 |
| 6/18/17 | 141.114 |
| 6/19/17 | 141.252 |
| 6/20/17 | 140.91 |
| 6/21/17 | 141.908 |
| 6/22/17 | 141.803 |
| 6/23/17 | 141.383 |
| 6/25/17 | 141.767 |
| 6/26/17 | 141.769 |
| 6/27/17 | 139.957 |
| 6/28/17 | 141.577 |
| 6/29/17 | 141.163 |
| 6/30/17 | 141.273 |
| 7/2/17 | 140.645 |
| 7/3/17 | 140.537 |
| 7/4/17 | 139.867 |
| 7/5/17 | 140.344 |
| 7/6/17 | 142.32 |
| 7/7/17 | 142.425 |
| 7/9/17 | 141.271 |
| 7/10/17 | 141.282 |
| 7/11/17 | 140.815 |
| 7/12/17 | 141.596 |
| 7/13/17 | 139.963 |
| 7/14/17 | 139.646 |
| 7/16/17 | 139.578 |
| 7/17/17 | 139.837 |
| 7/18/17 | 139.947 |
| 7/19/17 | 140.861 |
| 7/20/17 | 140.619 |
| 7/21/17 | 141.116 |
| 7/23/17 | 142.686 |
| 7/24/17 | 142.68 |
| 7/25/17 | 143.339 |
| 7/26/17 | 143.218 |
| 7/27/17 | 143.219 |
| 7/28/17 | 143.314 |
| 7/30/17 | 144.478 |
| 7/31/17 | 144.307 |
| 8/1/17 | 143.843 |
| 8/2/17 | 143.87 |
| 8/3/17 | 144.302 |
| 8/4/17 | 144.508 |
| 8/6/17 | 143.037 |
| 8/7/17 | 142.812 |
| 8/8/17 | 142.74 |
| 8/9/17 | 143.273 |
| 8/10/17 | 145.168 |
| 8/11/17 | 146.565 |
| 8/13/17 | 146.586 |
| 8/14/17 | 146.53 |
| 8/15/17 | 145.035 |
| 8/16/17 | 144.761 |
| 8/17/17 | 145.092 |
| 8/18/17 | 146.216 |
| 8/20/17 | 145.099 |
| 8/21/17 | 145.17 |
| 8/22/17 | 145.242 |
| 8/23/17 | 144.286 |
| 8/24/17 | 144.519 |
| 8/25/17 | 144.196 |
| 8/27/17 | 143.053 |
| 8/28/17 | 143.159 |
| 8/29/17 | 146.478 |
| 8/30/17 | 145.156 |
| 8/31/17 | 145.261 |
| 9/1/17 | 146.683 |
| 9/3/17 | 147.363 |
| 9/4/17 | 147.413 |
| 9/5/17 | 147.069 |
| 9/6/17 | 148.332 |
| 9/7/17 | 146.995 |
| 9/8/17 | 147.708 |
| 9/10/17 | 146.378 |
| 9/11/17 | 146.655 |
| 9/12/17 | 145.623 |
| 9/13/17 | 146.965 |
| 9/14/17 | 147.114 |
| 9/15/17 | 147.282 |
| 9/18/17 | 145.903 |
| 9/19/17 | 146.84 |
| 9/20/17 | 147.03 |
| 9/21/17 | 146.413 |
| 9/22/17 | 145.66 |
| 9/24/17 | 146.127 |
| 9/25/17 | 145.439 |
| 9/26/17 | 149.118 |
| 9/27/17 | 147.351 |
| 9/28/17 | 147.719 |
| 9/29/17 | 147.3 |
| 10/1/17 | 146.761 |
| 10/2/17 | 146.519 |
| 10/3/17 | 145.908 |
| 10/4/17 | 146.232 |
| 10/5/17 | 146.413 |
| 10/6/17 | 146.394 |
| 10/8/17 | 151.069 |
| 10/9/17 | 152.463 |
| 10/10/17 | 152.932 |
| 10/11/17 | 153.742 |
| 10/12/17 | 151.467 |
| 10/13/17 | 152.203 |
| 10/15/17 | 152.669 |
| 10/16/17 | 152.189 |
| 10/17/17 | 151.824 |
| 10/18/17 | 151.601 |
| 10/19/17 | 151.283 |
| 10/20/17 | 151.536 |
| 10/22/17 | 151.706 |
| 10/23/17 | 151.141 |
| 10/24/17 | 153.139 |
| 10/25/17 | 153.302 |
| 10/26/17 | 154.61 |
| 10/27/17 | 155.606 |
| 10/29/17 | 154.784 |
| 10/30/17 | 154.972 |
| 10/31/17 | 155.19 |
| 11/1/17 | 154.652 |
| 11/2/17 | 156.537 |
| 11/3/17 | 156.112 |
| 11/5/17 | 158.76 |
| 11/6/17 | 158.624 |
| 11/7/17 | 157.595 |
| 11/8/17 | 159.596 |
| 11/9/17 | 159.335 |
| 11/10/17 | 159.828 |
| 11/12/17 | 158.407 |
| 11/13/17 | 158.391 |
| 11/14/17 | 158.982 |
| 11/15/17 | 160.185 |
| 11/16/17 | 159.73 |
| 11/17/17 | 158.942 |
| 11/19/17 | 160.569 |
| 11/20/17 | 160.924 |
| 11/21/17 | 161.684 |
| 11/22/17 | 163.241 |
| 11/23/17 | 162.649 |
| 11/24/17 | 162.847 |
| 11/26/17 | 163.595 |
| 11/27/17 | 163.611 |
| 11/28/17 | 162.599 |
| 11/29/17 | 165.001 |
| 11/30/17 | 163.396 |
| 12/1/17 | 160.608 |
| 12/3/17 | 160.796 |
| 12/4/17 | 160.839 |
| 12/5/17 | 159.099 |
| 12/6/17 | 156.415 |
| 12/7/17 | 156.51 |
| 12/8/17 | 154.955 |
| 12/10/17 | 153.992 |
| 12/11/17 | 154.056 |
| 12/12/17 | 153.174 |
| 12/13/17 | 153.797 |
| 12/14/17 | 153.783 |
| 12/15/17 | 156.566 |
| 12/17/17 | 156.06 |
| 12/18/17 | 155.448 |
| 12/19/17 | 155.347 |
| 12/20/17 | 155.659 |
| 12/21/17 | 155.715 |
| 12/22/17 | 155.649 |
| 12/25/17 | 155.928 |
| 12/26/17 | 155.882 |
| 12/27/17 | 156.989 |
| 12/28/17 | 157.955 |
| 12/29/17 | 157.18 |
| 1/2/18 | 159.252 |
| 1/3/18 | 159.877 |
| 1/4/18 | 159.417 |
| 1/5/18 | 159.314 |
| 1/7/18 | 158.666 |
| 1/8/18 | 158.433 |
| 1/9/18 | 158.707 |
| 1/10/18 | 158.853 |
| 1/11/18 | 160.963 |
| 1/12/18 | 160.511 |
| 1/14/18 | 161.459 |
| 1/15/18 | 161.412 |
| 1/16/18 | 163.979 |
| 1/17/18 | 163.805 |
| 1/18/18 | 163.094 |
| 1/19/18 | 161.025 |
| 1/21/18 | 164.289 |
| 1/22/18 | 164.382 |
| 1/23/18 | 161.906 |
| 1/24/18 | 162.58 |
| 1/25/18 | 163.551 |
| 1/26/18 | 162.832 |
| 1/28/18 | 162.851 |
| 1/29/18 | 162.957 |
| 1/30/18 | 163.311 |
| 1/31/18 | 162.632 |
| 2/1/18 | 162.524 |
| 2/2/18 | 161.92 |
| 2/4/18 | 161.643 |
| 2/5/18 | 161.683 |
| 2/6/18 | 163.228 |
| 2/7/18 | 160.592 |
| 2/8/18 | 161.338 |
| 2/9/18 | 162.541 |
| 2/11/18 | 161.355 |
| 2/12/18 | 161.597 |
| 2/13/18 | 161.546 |
| 2/14/18 | 163.076 |
| 2/15/18 | 164.567 |
| 2/16/18 | 163.935 |
| 2/18/18 | 162.376 |
| 2/19/18 | 162.409 |
| 2/20/18 | 162.619 |
| 2/21/18 | 162.458 |
| 2/22/18 | 161.805 |
| 2/23/18 | 161.863 |
| 2/25/18 | 161.795 |
| 2/26/18 | 161.689 |
| 2/27/18 | 162.167 |
| 2/28/18 | 161.641 |
| 3/1/18 | 161.058 |
| 3/2/18 | 161.293 |
| 3/4/18 | 162.1 |
| 3/5/18 | 162.149 |
| 3/6/18 | 161.836 |
| 3/7/18 | 163.579 |
| 3/8/18 | 162.143 |
| 3/9/18 | 162.448 |
| 3/11/18 | 162.34 |
| 3/12/18 | 162.205 |
| 3/13/18 | 163.77 |
| 3/14/18 | 165.05 |
| 3/15/18 | 165.379 |
| 3/16/18 | 164.799 |
| 3/18/18 | 165.38 |
| 3/19/18 | 165.619 |
| 3/20/18 | 167.03 |
| 3/21/18 | 165.651 |
| 3/22/18 | 167.437 |
| 3/23/18 | 170.418 |
| 3/25/18 | 172.204 |
| 3/26/18 | 172.663 |
| 3/27/18 | 172.514 |
| 3/28/18 | 172.21 |
| 3/29/18 | 171.18 |
| 4/1/18 | 168.654 |
| 4/2/18 | 168.732 |
| 4/3/18 | 171.683 |
| 4/4/18 | 171.09 |
| 4/5/18 | 171.507 |
| 4/6/18 | 173.324 |
| 4/8/18 | 173.459 |
| 4/9/18 | 173.45 |
| 4/10/18 | 175.166 |
| 4/11/18 | 177.367 |
| 4/12/18 | 180.169 |
| 4/13/18 | 176.993 |
| 4/15/18 | 177.334 |
| 4/16/18 | 176.87 |
| 4/17/18 | 177.566 |
| 4/18/18 | 177.214 |
| 4/19/18 | 174.521 |
| 4/20/18 | 174.94 |
| 4/22/18 | 175.207 |
| 4/23/18 | 174.839 |
| 4/24/18 | 174.986 |
| 4/25/18 | 175.045 |
| 4/26/18 | 173.584 |
| 4/27/18 | 172.472 |
| 4/29/18 | 172.402 |
| 4/30/18 | 172.522 |
| 5/1/18 | 171.632 |
| 5/2/18 | 172.485 |
| 5/3/18 | 175.67 |
| 5/4/18 | 178.311 |
| 5/6/18 | 179.299 |
| 5/7/18 | 179.345 |
| 5/8/18 | 180.46 |
| 5/9/18 | 184.158 |
| 5/10/18 | 180.936 |
| 5/11/18 | 180.022 |
| 5/13/18 | 183.218 |
| 5/14/18 | 183.041 |
| 5/15/18 | 183.975 |
| 5/16/18 | 185.173 |
| 5/17/18 | 184.003 |
| 5/18/18 | 184.983 |
| 5/20/18 | 186.825 |
| 5/21/18 | 186.792 |
| 5/22/18 | 190.646 |
| 5/23/18 | 196.954 |
| 5/24/18 | 190.55 |
| 5/25/18 | 199.498 |
| 5/27/18 | 196.406 |
| 5/28/18 | 196.478 |
| 5/29/18 | 191.292 |
| 5/30/18 | 191.069 |
| 5/31/18 | 187.161 |
| 6/1/18 | 189.282 |
| 6/3/18 | 193.419 |
| 6/4/18 | 193.138 |
| 6/5/18 | 190.412 |
| 6/6/18 | 191.521 |
| 6/7/18 | 190.226 |
| 6/8/18 | 186.888 |
| 6/10/18 | 187.404 |
| 6/11/18 | 187.275 |
| 6/12/18 | 188.703 |
| 6/13/18 | 191.107 |
| 6/14/18 | 194.786 |
| 6/15/18 | 198.521 |
| 6/17/18 | 195.315 |
| 6/18/18 | 195.287 |
| 6/19/18 | 193.965 |
| 6/20/18 | 194.367 |
| 6/21/18 | 193.688 |
| 6/22/18 | 193.118 |
| 6/24/18 | 188.474 |
| 6/25/18 | 188.481 |
| 6/26/18 | 190.825 |
| 6/27/18 | 186.675 |
| 6/28/18 | 186.198 |
| 6/29/18 | 184.365 |
| 7/1/18 | 185.269 |
| 7/2/18 | 185.207 |
| 7/3/18 | 184.206 |
| 7/4/18 | 188.636 |
| 7/5/18 | 188.969 |
| 7/6/18 | 186.317 |
| 7/8/18 | 184.722 |
| 7/9/18 | 184.988 |
| 7/10/18 | 190.843 |
| 7/11/18 | 190.413 |
| 7/12/18 | 195.4 |
| 7/13/18 | 195.019 |
| 7/15/18 | 193.449 |
| 7/16/18 | 193.802 |
| 7/17/18 | 193.626 |
| 7/18/18 | 189.508 |
| 7/19/18 | 189.357 |
| 7/20/18 | 189.187 |
| 7/22/18 | 189.475 |
| 7/23/18 | 189.477 |
| 7/24/18 | 186.504 |
| 7/25/18 | 192.26 |
| 7/26/18 | 190.241 |
| 7/27/18 | 191.709 |
| 7/29/18 | 190.915 |
| 7/30/18 | 190.908 |
| 7/31/18 | 192.044 |
| 8/1/18 | 193.58 |
| 8/2/18 | 195.149 |
| 8/3/18 | 197.846 |
| 8/5/18 | 198.902 |
| 8/6/18 | 199.209 |
| 8/7/18 | 204.491 |
| 8/8/18 | 205.133 |
| 8/9/18 | 207.116 |
| 8/10/18 | 216.469 |
| 8/12/18 | 264.582 |
| 8/13/18 | 263.044 |
| 8/14/18 | 266.755 |
| 8/15/18 | 244.779 |
| 8/16/18 | 225.72 |
| 8/17/18 | 220.953 |
| 8/19/18 | 228.036 |
| 8/20/18 | 228.64 |
| 8/21/18 | 233.659 |
| 8/22/18 | 233.324 |
| 8/23/18 | 231.739 |
| 8/24/18 | 232.077 |
| 8/26/18 | 232.364 |
| 8/27/18 | 232.511 |
| 8/28/18 | 240.056 |
| 8/29/18 | 242.249 |
| 8/30/18 | 251.294 |
| 8/31/18 | 259.827 |
| 9/2/18 | 253.962 |
| 9/3/18 | 253.822 |
| 9/4/18 | 256.235 |
| 9/5/18 | 255.698 |
| 9/6/18 | 253.119 |
| 9/7/18 | 254.557 |
| 9/9/18 | 246.28 |
| 9/10/18 | 247.061 |
| 9/11/18 | 248.641 |
| 9/12/18 | 247.855 |
| 9/13/18 | 246.273 |
| 9/14/18 | 236.862 |
| 9/16/18 | 236.543 |
| 9/17/18 | 236.426 |
| 9/18/18 | 243.843 |
| 9/19/18 | 246.888 |
| 9/20/18 | 242.044 |
| 9/21/18 | 241.563 |
| 9/23/18 | 242.965 |
| 9/24/18 | 242.953 |
| 9/25/18 | 237.423 |
| 9/26/18 | 239.208 |
| 9/27/18 | 235.087 |
| 9/28/18 | 228.634 |
| 9/30/18 | 232.254 |
| 10/1/18 | 231.431 |
| 10/2/18 | 227.067 |
| 10/3/18 | 232.255 |
| 10/4/18 | 233.366 |
| 10/5/18 | 238.424 |
| 10/7/18 | 238.682 |
| 10/8/18 | 238.566 |
| 10/9/18 | 234.054 |
| 10/10/18 | 233.554 |
| 10/11/18 | 233.412 |
| 10/12/18 | 232.502 |
| 10/14/18 | 230.484 |
| 10/15/18 | 231.088 |
| 10/16/18 | 227.971 |
| 10/17/18 | 224.255 |
| 10/18/18 | 219.92 |
| 10/19/18 | 222.115 |
| 10/21/18 | 222.922 |
| 10/22/18 | 222.983 |
| 10/23/18 | 222.707 |
| 10/24/18 | 227.627 |
| 10/25/18 | 226.608 |
| 10/26/18 | 223.184 |
| 10/28/18 | 222.022 |
| 10/29/18 | 221.597 |
| 10/30/18 | 219.861 |
| 10/31/18 | 215.575 |
| 11/1/18 | 218.344 |
| 11/2/18 | 218.996 |
| 11/4/18 | 215.339 |
| 11/5/18 | 215.504 |
| 11/6/18 | 210.651 |
| 11/7/18 | 211.656 |
| 11/8/18 | 211.538 |
| 11/9/18 | 214.802 |
| 11/11/18 | 212.779 |
| 11/12/18 | 212.755 |
| 11/13/18 | 211.55 |
| 11/14/18 | 211.865 |
| 11/15/18 | 212.729 |
| 11/16/18 | 210.525 |
| 11/18/18 | 210.247 |
| 11/19/18 | 209.979 |
| 11/20/18 | 209.122 |
| 11/21/18 | 211.523 |
| 11/22/18 | 209.691 |
| 11/23/18 | 209.129 |
| 11/25/18 | 208.456 |
| 11/26/18 | 208.491 |
| 11/27/18 | 206.248 |
| 11/28/18 | 205.513 |
| 11/29/18 | 204.923 |
| 11/30/18 | 203.546 |
| 12/2/18 | 203.577 |
| 12/3/18 | 204.08 |
| 12/4/18 | 207.98 |
| 12/5/18 | 214.628 |
| 12/6/18 | 212.152 |
| 12/7/18 | 212.391 |
| 12/9/18 | 213.42 |
| 12/10/18 | 213.767 |
| 12/11/18 | 213.187 |
| 12/12/18 | 214.24 |
| 12/13/18 | 214.274 |
| 12/14/18 | 213.586 |
| 12/16/18 | 213.583 |
| 12/17/18 | 213.766 |
| 12/18/18 | 215.305 |
| 12/19/18 | 214.483 |
| 12/20/18 | 211.948 |
| 12/21/18 | 213.638 |
| 12/23/18 | 215.087 |
| 12/24/18 | 215.22 |
| 12/25/18 | 215.785 |
| 12/26/18 | 215.383 |
| 12/27/18 | 215.455 |
| 12/28/18 | 217.117 |
| 12/30/18 | 218.239 |
| 12/31/18 | 217.375 |
| 1/1/19 | 217.899 |
| 1/2/19 | 217.944 |
| 1/3/19 | 227.947 |
| 1/4/19 | 227.973 |
| 1/6/19 | 220.502 |
| 1/7/19 | 219.973 |
| 1/8/19 | 223.131 |
| 1/9/19 | 226.542 |
| 1/10/19 | 227.585 |
| 1/11/19 | 224.838 |
| 1/13/19 | 226.667 |
| 1/14/19 | 227.031 |
| 1/15/19 | 226.833 |
| 1/16/19 | 225.727 |
| 1/17/19 | 222.271 |
| 1/18/19 | 222.693 |
| 1/20/19 | 219.934 |
| 1/21/19 | 219.729 |
| 1/22/19 | 219.153 |
| 1/23/19 | 220.619 |
| 1/24/19 | 218.4 |
| 1/25/19 | 217.055 |
| 1/27/19 | 221.037 |
| 1/28/19 | 220.296 |
| 1/29/19 | 223.187 |
| 1/30/19 | 223.757 |
| 1/31/19 | 221.956 |
| 2/1/19 | 220.086 |
| 2/3/19 | 221.079 |
| 2/4/19 | 220.924 |
| 2/5/19 | 220.036 |
| 2/6/19 | 219.985 |
| 2/7/19 | 219.286 |
| 2/8/19 | 222.246 |
| 2/10/19 | 221.906 |
| 2/11/19 | 221.867 |
| 2/12/19 | 222.031 |
| 2/13/19 | 221.256 |
| 2/14/19 | 222.162 |
| 2/15/19 | 222.59 |
| 2/17/19 | 224.868 |
| 2/18/19 | 224.546 |
| 2/19/19 | 226.003 |
| 2/20/19 | 227.615 |
| 2/21/19 | 229.645 |
| 2/22/19 | 226.907 |
| 2/24/19 | 227.258 |
| 2/25/19 | 227.196 |
| 2/26/19 | 226.478 |
| 2/27/19 | 226.714 |
| 2/28/19 | 225.699 |
| 3/1/19 | 225.763 |
| 3/3/19 | 223.439 |
| 3/4/19 | 223.739 |
| 3/5/19 | 223.165 |
| 3/6/19 | 223.107 |
| 3/7/19 | 224.952 |
| 3/8/19 | 225.76 |
| 3/10/19 | 227.018 |
| 3/11/19 | 226.676 |
| 3/12/19 | 225.853 |
| 3/13/19 | 228.417 |
| 3/14/19 | 229.923 |
| 3/15/19 | 227.976 |
| 3/17/19 | 228.081 |
| 3/18/19 | 227.904 |
| 3/19/19 | 229.186 |
| 3/20/19 | 229.991 |
| 3/21/19 | 229.597 |
| 3/22/19 | 230.047 |
| 3/24/19 | 242.683 |
| 3/25/19 | 239.976 |
| 3/26/19 | 236.329 |
| 3/27/19 | 227.111 |
| 3/28/19 | 227.117 |
| 3/29/19 | 231.355 |
| 3/31/19 | 232.346 |
| 4/1/19 | 232.526 |
| 4/2/19 | 228.34 |
| 4/3/19 | 233.305 |
| 4/4/19 | 233.551 |
| 4/5/19 | 232.966 |
| 4/7/19 | 234.157 |
| 4/8/19 | 234.171 |
| 4/9/19 | 237.533 |
| 4/10/19 | 238.457 |
| 4/11/19 | 239.007 |
| 4/12/19 | 238.32 |
| 4/14/19 | 239.467 |
| 4/15/19 | 239.956 |
| 4/16/19 | 240.482 |
| 4/17/19 | 237.627 |
| 4/18/19 | 235.935 |
| 4/21/19 | 239.289 |
| 4/22/19 | 239.188 |
| 4/23/19 | 238.911 |
| 4/24/19 | 238.68 |
| 4/25/19 | 241.309 |
| 4/26/19 | 245.006 |
| 4/28/19 | 245.952 |
| 4/29/19 | 245.857 |
| 4/30/19 | 244.999 |
| 5/1/19 | 246.123 |
| 5/2/19 | 244.796 |
| 5/3/19 | 243.755 |
| 5/5/19 | 246.997 |
| 5/6/19 | 247.143 |
| 5/7/19 | 251.222 |
| 5/8/19 | 254.446 |
| 5/9/19 | 253.846 |
| 5/10/19 | 254.259 |
| 5/12/19 | 248.557 |
| 5/13/19 | 248.017 |
| 5/14/19 | 255.158 |
| 5/15/19 | 251.913 |
| 5/16/19 | 250.774 |
| 5/17/19 | 250.393 |
| 5/19/19 | 248.775 |
| 5/20/19 | 249.035 |
| 5/21/19 | 247.546 |
| 5/22/19 | 248.575 |
| 5/23/19 | 250.845 |
| 5/24/19 | 252.623 |
| 5/26/19 | 251.767 |
| 5/27/19 | 251.203 |
| 5/28/19 | 250.792 |
| 5/29/19 | 248.205 |
| 5/30/19 | 247.763 |
| 5/31/19 | 245.368 |
| 6/2/19 | 245.807 |
| 6/3/19 | 246.701 |
| 6/4/19 | 248.663 |
| 6/5/19 | 246.164 |
| 6/6/19 | 244.808 |
| 6/7/19 | 248.373 |
| 6/9/19 | 250.435 |
| 6/10/19 | 250.814 |
| 6/11/19 | 247.593 |
| 6/12/19 | 247.845 |
| 6/13/19 | 249.39 |
| 6/14/19 | 254.001 |
| 6/16/19 | 255.251 |
| 6/17/19 | 254.676 |
| 6/18/19 | 253.01 |
| 6/19/19 | 252.175 |
| 6/20/19 | 253.082 |
| 6/21/19 | 257.787 |
| 6/23/19 | 258.911 |
| 6/24/19 | 260.737 |
| 6/25/19 | 265.918 |
| 6/26/19 | 264.312 |
| 6/27/19 | 261.758 |
| 6/28/19 | 261.897 |
| 6/30/19 | 256.456 |
| 7/1/19 | 256.913 |
| 7/2/19 | 251.826 |
| 7/3/19 | 260.13 |
| 7/4/19 | 256.469 |
| 7/5/19 | 255.908 |
| 7/7/19 | 259.452 |
| 7/8/19 | 257.696 |
| 7/9/19 | 257.032 |
| 7/10/19 | 256.978 |
| 7/11/19 | 260.041 |
| 7/12/19 | 256.965 |
| 7/14/19 | 260.404 |
| 7/15/19 | 260.895 |
| 7/16/19 | 259.922 |
| 7/17/19 | 257.976 |
| 7/18/19 | 260.354 |
| 7/19/19 | 260.993 |
| 7/21/19 | 259.431 |
| 7/22/19 | 259.251 |
| 7/23/19 | 259.662 |
| 7/24/19 | 260.703 |
| 7/25/19 | 261.815 |
| 7/26/19 | 259.414 |
| 7/28/19 | 258.309 |
| 7/29/19 | 258.349 |
| 7/30/19 | 257.339 |
| 7/31/19 | 255.791 |
| 8/1/19 | 253.379 |
| 8/2/19 | 259.186 |
| 8/4/19 | 257.859 |
| 8/5/19 | 256.9 |
| 8/6/19 | 264.926 |
| 8/7/19 | 262.5 |
| 8/8/19 | 265.171 |
| 8/9/19 | 265.289 |
| 8/11/19 | 264.651 |
| 8/12/19 | 265.28 |
| 8/13/19 | 270.535 |
| 8/14/19 | 268.983 |
| 8/15/19 | 273.7 |
| 8/16/19 | 273.462 |
| 8/18/19 | 271.263 |
| 8/19/19 | 271.175 |
| 8/20/19 | 271.769 |
| 8/21/19 | 277.667 |
| 8/22/19 | 276.629 |
| 8/23/19 | 277.785 |
| 8/25/19 | 286.131 |
| 8/26/19 | 289.813 |
| 8/27/19 | 286.413 |
| 8/28/19 | 289.326 |
| 8/29/19 | 288.092 |
| 8/30/19 | 286.71 |
| 9/1/19 | 287.502 |
| 9/2/19 | 287.024 |
| 9/3/19 | 284.958 |
| 9/4/19 | 285.244 |
| 9/5/19 | 282.989 |
| 9/6/19 | 277.957 |
| 9/8/19 | 276.354 |
| 9/9/19 | 276.32 |
| 9/10/19 | 276.387 |
| 9/11/19 | 275.864 |
| 9/12/19 | 276.098 |
| 9/13/19 | 272.66 |
| 9/15/19 | 276.35 |
| 9/16/19 | 277.35 |
| 9/17/19 | 275.932 |
| 9/18/19 | 275.172 |
| 9/19/19 | 272.387 |
| 9/20/19 | 275.748 |
| 9/22/19 | 279.108 |
| 9/23/19 | 279.51 |
| 9/24/19 | 279.625 |
| 9/25/19 | 280.543 |
| 9/26/19 | 274.873 |
| 9/27/19 | 274.703 |
| 9/29/19 | 272.48 |
| 9/30/19 | 272.666 |
| 10/1/19 | 267.69 |
| 10/2/19 | 272.475 |
| 10/3/19 | 275.084 |
| 10/4/19 | 276.254 |
| 10/6/19 | 277.264 |
| 10/7/19 | 277.038 |
| 10/8/19 | 280.212 |
| 10/9/19 | 283.13 |
| 10/10/19 | 285.662 |
| 10/11/19 | 280.77 |
| 10/13/19 | 282.043 |
| 10/14/19 | 281.388 |
| 10/15/19 | 284.362 |
| 10/16/19 | 282.267 |
| 10/17/19 | 281.897 |
| 10/18/19 | 279.252 |
| 10/20/19 | 277.99 |
| 10/21/19 | 278.097 |
| 10/22/19 | 279.609 |
| 10/23/19 | 277.766 |
| 10/24/19 | 275.286 |
| 10/25/19 | 278.626 |
| 10/27/19 | 278.948 |
| 10/28/19 | 279.179 |
| 10/29/19 | 274.806 |
| 10/30/19 | 275.031 |
| 10/31/19 | 274.168 |
| 11/1/19 | 277.741 |
| 11/3/19 | 277.524 |
| 11/4/19 | 277.583 |
| 11/5/19 | 277.816 |
| 11/6/19 | 274.672 |
| 11/7/19 | 275.603 |
| 11/8/19 | 271.7 |
| 11/10/19 | 270.682 |
| 11/11/19 | 270.94 |
| 11/12/19 | 270.099 |
| 11/13/19 | 270.765 |
| 11/14/19 | 270.887 |
| 11/15/19 | 271.719 |
| 11/17/19 | 271.282 |
| 11/18/19 | 271.449 |
| 11/19/19 | 271.26 |
| 11/20/19 | 270.404 |
| 11/21/19 | 270.239 |
| 11/22/19 | 268.44 |
| 11/24/19 | 268.509 |
| 11/25/19 | 268.438 |
| 11/26/19 | 268.409 |
| 11/27/19 | 270.523 |
| 11/28/19 | 270.75 |
| 11/29/19 | 269.668 |
| 12/1/19 | 270.454 |
| 12/2/19 | 270.219 |
| 12/3/19 | 270.046 |
| 12/4/19 | 272.693 |
| 12/5/19 | 272.729 |
| 12/6/19 | 272.847 |
| 12/8/19 | 271.178 |
| 12/9/19 | 271.363 |
| 12/10/19 | 272.987 |
| 12/11/19 | 273.272 |
| 12/12/19 | 275.127 |
| 12/13/19 | 272.003 |
| 12/15/19 | 275.706 |
| 12/16/19 | 275.382 |
| 12/17/19 | 277.491 |
| 12/18/19 | 279.282 |
| 12/19/19 | 281.132 |
| 12/20/19 | 282.436 |
| 12/22/19 | 282.236 |
| 12/23/19 | 282.305 |
| 12/24/19 | 284.085 |
| 12/25/19 | 286.251 |
| 12/26/19 | 286.317 |
| 12/27/19 | 288.258 |
| 12/29/19 | 289.152 |
| 12/30/19 | 289.525 |
| 12/31/19 | 289.774 |
| 1/1/20 | 290.727 |
| 1/2/20 | 290.356 |
| 1/3/20 | 292.844 |
| 1/5/20 | 300.737 |
| 1/6/20 | 301.206 |
| 1/7/20 | 300.176 |
| 1/8/20 | 306.481 |
| 1/9/20 | 296.081 |
| 1/10/20 | 293.544 |
| 1/12/20 | 294.822 |
| 1/13/20 | 294.717 |
| 1/14/20 | 291.43 |
| 1/15/20 | 293.321 |
| 1/16/20 | 294.109 |
| 1/17/20 | 292.33 |
| 1/19/20 | 295.436 |
| 1/20/20 | 295.089 |
| 1/21/20 | 296.901 |
| 1/22/20 | 296.991 |
| 1/23/20 | 297.282 |
| 1/24/20 | 297.611 |
| 1/26/20 | 302.123 |
| 1/27/20 | 302.616 |
| 1/28/20 | 302.146 |
| 1/29/20 | 299.656 |
| 1/30/20 | 302.251 |
| 1/31/20 | 302.742 |
| 2/2/20 | 305.674 |
| 2/3/20 | 305.562 |
| 2/4/20 | 303.795 |
| 2/5/20 | 298.777 |
| 2/6/20 | 299.332 |
| 2/7/20 | 301.471 |
| 2/9/20 | 302.75 |
| 2/10/20 | 303.236 |
| 2/11/20 | 303.611 |
| 2/12/20 | 303.207 |
| 2/13/20 | 305.148 |
| 2/14/20 | 306.398 |
| 2/16/20 | 308.022 |
| 2/17/20 | 308.305 |
| 2/18/20 | 308.057 |
| 2/19/20 | 312.162 |
| 2/20/20 | 315.005 |
| 2/21/20 | 318.323 |
| 2/23/20 | 325.587 |
| 2/24/20 | 327.422 |
| 2/25/20 | 325.352 |
| 2/26/20 | 324.118 |
| 2/27/20 | 325.552 |
| 2/28/20 | 328.574 |
| 3/1/20 | 319.847 |
| 3/2/20 | 318.542 |
| 3/3/20 | 315.842 |
| 3/4/20 | 323.412 |
| 3/5/20 | 320.047 |
| 3/6/20 | 328.715 |
| 3/8/20 | 333.383 |
| 3/9/20 | 334.922 |
| 3/10/20 | 329.894 |
| 3/11/20 | 328.031 |
| 3/12/20 | 328.277 |
| 3/13/20 | 320.273 |
| 3/15/20 | 315.001 |
| 3/16/20 | 315.167 |
| 3/17/20 | 311.547 |
| 3/18/20 | 316.482 |
| 3/19/20 | 312.01 |
| 3/20/20 | 309.755 |
| 3/22/20 | 317.568 |
| 3/23/20 | 314.872 |
| 3/24/20 | 329.899 |
| 3/25/20 | 338.323 |
| 3/26/20 | 332.488 |
| 3/27/20 | 334.721 |
| 3/29/20 | 338.317 |
| 3/30/20 | 338.25 |
| 3/31/20 | 341.588 |
| 4/1/20 | 335.903 |
| 4/2/20 | 343.317 |
| 4/3/20 | 344.14 |
| 4/5/20 | 348.88 |
| 4/6/20 | 351.126 |
| 4/7/20 | 362.243 |
| 4/8/20 | 358.587 |
| 4/9/20 | 358.775 |
| 4/12/20 | 364.989 |
| 4/13/20 | 364.711 |
| 4/14/20 | 374.217 |
| 4/15/20 | 378.412 |
| 4/16/20 | 380.847 |
| 4/17/20 | 381.896 |
| 4/19/20 | 374.196 |
| 4/20/20 | 372.146 |
| 4/21/20 | 377.477 |
| 4/22/20 | 378.583 |
| 4/23/20 | 384.237 |
| 4/24/20 | 386.571 |
| 4/26/20 | 386.292 |
| 4/27/20 | 386.498 |
| 4/28/20 | 384.011 |
| 4/29/20 | 383.056 |
| 4/30/20 | 383.024 |
| 5/1/20 | 379.412 |
| 5/3/20 | 383.462 |
| 5/4/20 | 383.684 |
| 5/5/20 | 386.161 |
| 5/6/20 | 388.16 |
| 5/7/20 | 391.159 |
| 5/8/20 | 391.334 |
| 5/10/20 | 387.981 |
| 5/11/20 | 389.423 |
| 5/12/20 | 385.674 |
| 5/13/20 | 382.977 |
| 5/14/20 | 385.229 |
| 5/15/20 | 385.879 |
| 5/17/20 | 386.624 |
| 5/18/20 | 389.573 |
| 5/19/20 | 383.582 |
| 5/20/20 | 380.883 |
| 5/21/20 | 381.246 |
| 5/22/20 | 376.876 |
| 5/24/20 | 379.957 |
| 5/25/20 | 379.001 |
| 5/26/20 | 378.329 |
| 5/27/20 | 370.975 |
| 5/28/20 | 373.035 |
| 5/29/20 | 377.334 |
| 5/31/20 | 380.875 |
| 6/1/20 | 381.185 |
| 6/2/20 | 381.552 |
| 6/3/20 | 372.277 |
| 6/4/20 | 367.893 |
| 6/5/20 | 371.916 |
| 6/7/20 | 366.231 |
| 6/8/20 | 365.83 |
| 6/9/20 | 369.959 |
| 6/10/20 | 374.336 |
| 6/11/20 | 378.035 |
| 6/12/20 | 379.72 |
| 6/14/20 | 379.372 |
| 6/15/20 | 379.864 |
| 6/16/20 | 378.457 |
| 6/17/20 | 379.533 |
| 6/18/20 | 379.893 |
| 6/19/20 | 379.99 |
| 6/21/20 | 384.851 |
| 6/22/20 | 385.273 |
| 6/23/20 | 386.442 |
| 6/24/20 | 389.424 |
| 6/25/20 | 388.427 |
| 6/26/20 | 389.19 |
| 6/28/20 | 391.034 |
| 6/29/20 | 390.365 |
| 6/30/20 | 390.429 |
| 7/1/20 | 392.789 |
| 7/2/20 | 389.332 |
| 7/3/20 | 391.235 |
| 7/5/20 | 391.436 |
| 7/6/20 | 391.817 |
| 7/7/20 | 393.964 |
| 7/8/20 | 395.742 |
| 7/9/20 | 398.999 |
| 7/10/20 | 398.063 |
| 7/12/20 | 397.371 |
| 7/13/20 | 397.3 |
| 7/14/20 | 397.575 |
| 7/15/20 | 399.408 |
| 7/16/20 | 399.831 |
| 7/17/20 | 396.602 |
| 7/19/20 | 398.69 |
| 7/20/20 | 398.821 |
| 7/21/20 | 400.766 |
| 7/22/20 | 404.8 |
| 7/23/20 | 411.59 |
| 7/24/20 | 414.911 |
| 7/26/20 | 418.422 |
| 7/27/20 | 421.127 |
| 7/28/20 | 434.977 |
| 7/29/20 | 436.716 |
| 7/30/20 | 440.815 |
| 7/31/20 | 438.995 |
| 8/2/20 | 444.65 |
| 8/3/20 | 445.223 |
| 8/4/20 | 442.4 |
| 8/5/20 | 452.605 |
| 8/6/20 | 461.824 |
| 8/7/20 | 482.024 |
| 8/9/20 | 473.777 |
| 8/10/20 | 476.21 |
| 8/11/20 | 478.252 |
| 8/12/20 | 444.178 |
| 8/13/20 | 452.869 |
| 8/14/20 | 462.351 |
| 8/16/20 | 461.091 |
| 8/17/20 | 458.024 |
| 8/18/20 | 470.942 |
| 8/19/20 | 475.435 |
| 8/20/20 | 451.408 |
| 8/21/20 | 458.444 |
| 8/23/20 | 454.947 |
| 8/24/20 | 456.287 |
| 8/25/20 | 457.891 |
| 8/26/20 | 459.006 |
| 8/27/20 | 462.799 |
| 8/28/20 | 456.096 |
| 8/30/20 | 463.456 |
| 8/31/20 | 465.163 |
| 9/1/20 | 465.453 |
| 9/2/20 | 467.272 |
| 9/3/20 | 461.037 |
| 9/4/20 | 460.985 |
| 9/6/20 | 462.649 |
| 9/7/20 | 463.067 |
| 9/8/20 | 463.075 |
| 9/9/20 | 464.568 |
| 9/10/20 | 468.257 |
| 9/11/20 | 465.435 |
| 9/13/20 | 466.547 |
| 9/14/20 | 467.085 |
| 9/15/20 | 471.297 |
| 9/16/20 | 470.531 |
| 9/17/20 | 472.31 |
| 9/18/20 | 472.888 |
| 9/20/20 | 474.264 |
| 9/21/20 | 473.777 |
| 9/22/20 | 470.679 |
| 9/23/20 | 469.757 |
| 9/24/20 | 459.672 |
| 9/25/20 | 457.534 |
| 9/27/20 | 459.04 |
| 9/28/20 | 459.085 |
| 9/29/20 | 472.021 |
| 9/30/20 | 476.688 |
| 10/1/20 | 468.541 |
| 10/2/20 | 474.151 |
| 10/4/20 | 474.807 |
| 10/5/20 | 475.077 |
| 10/6/20 | 477.46 |
| 10/7/20 | 471.491 |
| 10/8/20 | 478.113 |
| 10/9/20 | 484.176 |
| 10/11/20 | 486.831 |
| 10/12/20 | 487.263 |
| 10/13/20 | 488.319 |
| 10/14/20 | 482.531 |
| 10/15/20 | 482.831 |
| 10/16/20 | 486.355 |
| 10/18/20 | 484.736 |
| 10/19/20 | 483.826 |
| 10/20/20 | 482.077 |
| 10/21/20 | 483.055 |
| 10/22/20 | 482.544 |
| 10/23/20 | 486.666 |
| 10/25/20 | 487.345 |
| 10/26/20 | 486.832 |
| 10/27/20 | 494.878 |
| 10/28/20 | 502.197 |
| 10/29/20 | 500.013 |
| 10/30/20 | 499.2 |
| 11/1/20 | 504.838 |
| 11/2/20 | 505.254 |
| 11/3/20 | 514.184 |
| 11/4/20 | 519.483 |
| 11/5/20 | 517.359 |
| 11/6/20 | 527.338 |
| 11/8/20 | 534.82 |
| 11/9/20 | 531.664 |
| 11/10/20 | 487.707 |
| 11/11/20 | 493.992 |
| 11/12/20 | 467.912 |
| 11/13/20 | 463.705 |
| 11/15/20 | 465.577 |
| 11/16/20 | 468.494 |
| 11/17/20 | 467.86 |
| 11/18/20 | 466.368 |
| 11/19/20 | 464.254 |
| 11/20/20 | 451.621 |
| 11/22/20 | 459.739 |
| 11/23/20 | 459.734 |
| 11/24/20 | 465.502 |
| 11/25/20 | 465.124 |
| 11/26/20 | 461.946 |
| 11/27/20 | 458.322 |
| 11/29/20 | 451.215 |
| 11/30/20 | 450.781 |
| 12/1/20 | 447.849 |
| 12/2/20 | 455.729 |
| 12/3/20 | 462.255 |
| 12/4/20 | 460.607 |
| 12/6/20 | 461.491 |
| 12/7/20 | 460.534 |
| 12/8/20 | 467.442 |
| 12/9/20 | 469.886 |
| 12/10/20 | 461.444 |
| 12/11/20 | 465.932 |
| 12/13/20 | 464.83 |
| 12/14/20 | 464.374 |
| 12/15/20 | 461.484 |
| 12/16/20 | 466.553 |
| 12/17/20 | 467.456 |
| 12/18/20 | 466.463 |
| 12/20/20 | 463.857 |
| 12/21/20 | 464.11 |
| 12/22/20 | 462.227 |
| 12/23/20 | 459.255 |
| 12/24/20 | 460.467 |
| 12/25/20 | 457.824 |
| 12/27/20 | 456.089 |
| 12/28/20 | 460.196 |
| 12/29/20 | 449.326 |
| 12/30/20 | 446.611 |
| 12/31/20 | 449.85 |
| 1/1/21 | 454.121 |
| 1/3/21 | 454.337 |
| 1/4/21 | 458.082 |
| 1/5/21 | 463.778 |
| 1/6/21 | 463.352 |
| 1/7/21 | 451.847 |
| 1/8/21 | 451.844 |
| 1/10/21 | 438.559 |
| 1/11/21 | 436.575 |
| 1/12/21 | 444.121 |
| 1/13/21 | 445.272 |
| 1/14/21 | 439.659 |
| 1/15/21 | 437.76 |
| 1/17/21 | 438.834 |
| 1/18/21 | 434.461 |
| 1/19/21 | 442.155 |
| 1/20/21 | 442.155 |
| 1/21/21 | 445.862 |
| 1/22/21 | 443.081 |
| 1/24/21 | 442.256 |
| 1/25/21 | 443.06 |
| 1/26/21 | 442.201 |
| 1/27/21 | 437.587 |
| 1/28/21 | 437.614 |
| 1/29/21 | 435.745 |
| 1/31/21 | 434.847 |
| 2/1/21 | 434.531 |
| 2/2/21 | 429.592 |
| 2/3/21 | 425.018 |
| 2/4/21 | 422.274 |
| 2/5/21 | 412.075 |
| 2/7/21 | 411.744 |
| 2/8/21 | 412.724 |
| 2/9/21 | 416.812 |
| 2/10/21 | 417.184 |
| 2/11/21 | 417.977 |
| 2/12/21 | 412.84 |
| 2/14/21 | 412.626 |
| 2/15/21 | 411.877 |
| 2/16/21 | 407.151 |
| 2/17/21 | 401.769 |
| 2/18/21 | 398.672 |
| 2/19/21 | 397.271 |
| 2/21/21 | 400.249 |
| 2/22/21 | 400.486 |
| 2/23/21 | 408.702 |
| 2/24/21 | 412.714 |
| 2/25/21 | 415.472 |
| 2/26/21 | 417.972 |
| 2/28/21 | 414.326 |
| 3/1/21 | 415.08 |
| 3/2/21 | 403.814 |
| 3/3/21 | 410.309 |
| 3/4/21 | 410.334 |
| 3/5/21 | 410.226 |
| 3/7/21 | 411.744 |
| 3/8/21 | 412.882 |
| 3/9/21 | 420.746 |
| 3/10/21 | 420.418 |
| 3/11/21 | 416.653 |
| 3/12/21 | 414.292 |
| 3/14/21 | 420.235 |
| 3/15/21 | 419.656 |
| 3/16/21 | 419.283 |
| 3/17/21 | 417.177 |
| 3/18/21 | 421.636 |
| 3/19/21 | 408.647 |
| 3/21/21 | 405.041 |
| 3/22/21 | 453.646 |
| 3/23/21 | 438.021 |
| 3/24/21 | 441.208 |
| 3/25/21 | 441.799 |
| 3/26/21 | 441.693 |
| 3/28/21 | 450.206 |
| 3/29/21 | 452.106 |
| 3/30/21 | 454.987 |
| 3/31/21 | 451.41 |
| 4/1/21 | 453.452 |
| 4/2/21 | 452.007 |
| 4/4/21 | 455.193 |
| 4/5/21 | 454.831 |
| 4/6/21 | 451.387 |
| 4/7/21 | 456.786 |
| 4/8/21 | 455.778 |
| 4/9/21 | 459.32 |
| 4/11/21 | 458.496 |
| 4/12/21 | 457.823 |
| 4/13/21 | 454.397 |
| 4/14/21 | 455.618 |
| 4/15/21 | 450.968 |
| 4/16/21 | 455.646 |
| 4/18/21 | 461.202 |
| 4/19/21 | 461.661 |
| 4/20/21 | 461.25 |
| 4/21/21 | 463.702 |
| 4/22/21 | 472.797 |
| 4/23/21 | 477.14 |
| 4/25/21 | 481.285 |
| 4/26/21 | 480.718 |
| 4/27/21 | 474.612 |
| 4/28/21 | 469.895 |
| 4/29/21 | 470.561 |
| 4/30/21 | 468.014 |
| 5/2/21 | 471.626 |
| 5/3/21 | 471.648 |
| 5/4/21 | 476.299 |
| 5/5/21 | 476.131 |
| 5/6/21 | 478.104 |
| 5/7/21 | 483.519 |
| 5/9/21 | 485.294 |
| 5/10/21 | 487.13 |
| 5/11/21 | 488.578 |
| 5/12/21 | 489.734 |
| 5/13/21 | 493.181 |
| 5/14/21 | 499.093 |
| 5/16/21 | 500.931 |
| 5/17/21 | 501.829 |
| 5/18/21 | 499.524 |
| 5/19/21 | 502.709 |
| 5/20/21 | 504.867 |
| 5/21/21 | 505.037 |
| 5/23/21 | 508.544 |
| 5/24/21 | 509.995 |
| 5/25/21 | 506.104 |
| 5/26/21 | 516.21 |
| 5/27/21 | 515.508 |
| 5/28/21 | 518.861 |
| 5/30/21 | 524.254 |
| 5/31/21 | 525.198 |
| 6/1/21 | 520.955 |
| 6/2/21 | 526.072 |
| 6/3/21 | 527.204 |
| 6/4/21 | 523.932 |
| 6/6/21 | 526.459 |
| 6/7/21 | 527.136 |
| 6/8/21 | 526.026 |
| 6/9/21 | 523.851 |
| 6/10/21 | 521.469 |
| 6/11/21 | 514.38 |
| 6/13/21 | 506.338 |
| 6/14/21 | 505.303 |
| 6/15/21 | 508.169 |
| 6/16/21 | 511.438 |
| 6/17/21 | 504.127 |
| 6/18/21 | 498.02 |
| 6/20/21 | 496.386 |
| 6/21/21 | 498.368 |
| 6/22/21 | 503.724 |
| 6/23/21 | 494.439 |
| 6/24/21 | 493.786 |
| 6/25/21 | 496.868 |
| 6/27/21 | 502.012 |
| 6/28/21 | 501.765 |
| 6/29/21 | 496.722 |
| 6/30/21 | 494.785 |
| 7/1/21 | 495.021 |
| 7/2/21 | 495.163 |
| 7/4/21 | 499.008 |
| 7/5/21 | 499.217 |
| 7/6/21 | 499.124 |
| 7/7/21 | 501.46 |
| 7/8/21 | 503.498 |
| 7/9/21 | 503.906 |
| 7/11/21 | 503.419 |
| 7/12/21 | 503.045 |
| 7/13/21 | 501.845 |
| 7/14/21 | 500.774 |
| 7/15/21 | 504.447 |
| 7/16/21 | 504.053 |
| 7/18/21 | 496.799 |
| 7/19/21 | 498.473 |
| 7/20/21 | 500.092 |
| 7/21/21 | 499.147 |
| 7/22/21 | 496.234 |
| 7/23/21 | 497.531 |
| 7/25/21 | 495.017 |
| 7/26/21 | 495.136 |
| 7/27/21 | 494.717 |
| 7/28/21 | 495.395 |
| 7/29/21 | 497.827 |
| 7/30/21 | 497.732 |
| 8/1/21 | 492.347 |
| 8/2/21 | 492.446 |
| 8/3/21 | 486.933 |
| 8/4/21 | 489.557 |
| 8/5/21 | 493.942 |
| 8/6/21 | 494.66 |
| 8/8/21 | 489.517 |
| 8/9/21 | 477.285 |
| 8/10/21 | 481.838 |
| 8/11/21 | 478.014 |
| 8/12/21 | 486.26 |
| 8/13/21 | 482.986 |
| 8/15/21 | 487.921 |
| 8/16/21 | 487.098 |
| 8/17/21 | 486.275 |
| 8/18/21 | 484.372 |
| 8/19/21 | 486.189 |
| 8/20/21 | 488.345 |
| 8/22/21 | 486.975 |
| 8/23/21 | 485.847 |
| 8/24/21 | 489.255 |
| 8/25/21 | 487.579 |
| 8/26/21 | 482.728 |
| 8/27/21 | 483.494 |
| 8/29/21 | 488.244 |
| 8/30/21 | 488.576 |
| 8/31/21 | 487.848 |
| 9/1/21 | 485.384 |
| 9/2/21 | 483.634 |
| 9/3/21 | 482.171 |
| 9/5/21 | 489.054 |
| 9/6/21 | 489.121 |
| 9/7/21 | 485.727 |
| 9/8/21 | 482.121 |
| 9/9/21 | 487.886 |
| 9/10/21 | 487.316 |
| 9/12/21 | 486.249 |
| 9/13/21 | 486.709 |
| 9/14/21 | 485.912 |
| 9/15/21 | 489.193 |
| 9/16/21 | 486.595 |
| 9/17/21 | 481.5 |
| 9/19/21 | 487.768 |
| 9/20/21 | 487.52 |
| 9/21/21 | 492.053 |
| 9/22/21 | 492.192 |
| 9/23/21 | 492.107 |
| 9/24/21 | 492.465 |
| 9/26/21 | 498.77 |
| 9/27/21 | 498.751 |
| 9/28/21 | 496.709 |
| 9/29/21 | 495.004 |
| 9/30/21 | 496.076 |
| 10/1/21 | 501.074 |
| 10/3/21 | 501.687 |
| 10/4/21 | 502.065 |
| 10/5/21 | 503.316 |
| 10/6/21 | 501.772 |
| 10/7/21 | 503.47 |
| 10/8/21 | 501.088 |
| 10/10/21 | 506.33 |
| 10/11/21 | 505.488 |
| 10/12/21 | 507.424 |
| 10/13/21 | 511.744 |
| 10/14/21 | 527.292 |
| 10/15/21 | 530.728 |
| 10/17/21 | 526.342 |
| 10/18/21 | 527.504 |
| 10/19/21 | 529.998 |
| 10/20/21 | 529.38 |
| 10/21/21 | 528.261 |
| 10/22/21 | 547.007 |
| 10/24/21 | 554.313 |
| 10/25/21 | 560.596 |
| 10/26/21 | 557.467 |
| 10/27/21 | 550.341 |
| 10/28/21 | 549.731 |
| 10/29/21 | 551.705 |
| 10/31/21 | 550.438 |
| 11/1/21 | 548.996 |
| 11/2/21 | 549.981 |
| 11/3/21 | 551.953 |
| 11/4/21 | 551.18 |
| 11/5/21 | 558.771 |
| 11/7/21 | 567.583 |
| 11/8/21 | 566.95 |
| 11/9/21 | 568.58 |
| 11/10/21 | 572.663 |
| 11/11/21 | 585.379 |
| 11/12/21 | 594.327 |
| 11/14/21 | 600.016 |
| 11/15/21 | 601.787 |
| 11/16/21 | 602.609 |
| 11/17/21 | 615.581 |
| 11/18/21 | 646.558 |
| 11/19/21 | 661.191 |
| 11/21/21 | 666.165 |
| 11/22/21 | 661.626 |
| 11/23/21 | 663.714 |
| 11/24/21 | 738.536 |
| 11/25/21 | 685.845 |
| 11/26/21 | 692.832 |
| 11/28/21 | 713 |
| 11/29/21 | 712.769 |
| 11/30/21 | 730.839 |
| 12/1/21 | 770.12 |
| 12/2/21 | 767.993 |
| 12/3/21 | 779.338 |
| 12/5/21 | 785.222 |
| 12/6/21 | 784.653 |
| 12/7/21 | 790.8 |
| 12/8/21 | 776.195 |
| 12/9/21 | 784.059 |
| 12/10/21 | 787.68 |
| 12/12/21 | 795.573 |
| 12/13/21 | 794.989 |
| 12/14/21 | 793.956 |
| 12/15/21 | 819.305 |
| 12/16/21 | 846.928 |
| 12/17/21 | 907.449 |
| 12/19/21 | 961.768 |
| 12/20/21 | 966.494 |
| 12/21/21 | 783.115 |
| 12/22/21 | 711.409 |
| 12/23/21 | 698.276 |
| 12/24/21 | 659.966 |
| 12/26/21 | 633.885 |
| 12/27/21 | 643.587 |
| 12/28/21 | 677.71 |
| 12/29/21 | 688.61 |
| 12/30/21 | 734.433 |
| 12/31/21 | 777.396 |
| 1/2/22 | 793.409 |
| 1/3/22 | 787.801 |
| 1/4/22 | 759.531 |
| 1/5/22 | 781.11 |
| 1/6/22 | 796.544 |
| 1/7/22 | 793.559 |
| 1/9/22 | 801.037 |
| 1/10/22 | 795.633 |
| 1/11/22 | 800.516 |
| 1/12/22 | 805.646 |
| 1/13/22 | 777.412 |
| 1/14/22 | 795.432 |
| 1/16/22 | 789.663 |
| 1/17/22 | 790.176 |
| 1/18/22 | 786.752 |
| 1/19/22 | 789.251 |
| 1/20/22 | 794.081 |
| 1/21/22 | 789.884 |
| 1/23/22 | 794.395 |
| 1/24/22 | 794.699 |
| 1/25/22 | 797.918 |
| 1/26/22 | 801.85 |
| 1/27/22 | 794.401 |
| 1/28/22 | 786.936 |
| 1/30/22 | 779.524 |
| 1/31/22 | 777.757 |
| 2/1/22 | 769.074 |
| 2/2/22 | 774.931 |
| 2/3/22 | 783.534 |
| 2/4/22 | 787.681 |
| 2/6/22 | 787.781 |
| 2/7/22 | 789.338 |
| 2/8/22 | 796.255 |
| 2/9/22 | 797.505 |
| 2/10/22 | 797.435 |
| 2/11/22 | 792.685 |
| 2/13/22 | 808.256 |
| 2/14/22 | 808.656 |
| 2/15/22 | 818.151 |
| 2/16/22 | 810.682 |
| 2/17/22 | 817.402 |
| 2/18/22 | 826.681 |
| 2/20/22 | 834.506 |
| 2/21/22 | 835.309 |
| 2/22/22 | 840.122 |
| 2/23/22 | 841.667 |
| 2/24/22 | 848.97 |
| 2/25/22 | 860.446 |
| 2/27/22 | 853.933 |
| 2/28/22 | 863.55 |
| 3/1/22 | 848.361 |
| 3/2/22 | 867.547 |
| 3/3/22 | 867.919 |
| 3/4/22 | 877.859 |
| 3/6/22 | 902.165 |
| 3/7/22 | 912.127 |
| 3/8/22 | 924.356 |
| 3/9/22 | 952.776 |
| 3/10/22 | 936.801 |
| 3/11/22 | 954.613 |
| 3/13/22 | 941.827 |
| 3/14/22 | 938.377 |
| 3/15/22 | 930.378 |
| 3/16/22 | 907.878 |
| 3/17/22 | 904.686 |
| 3/18/22 | 919.796 |
| 3/20/22 | 916.241 |
| 3/21/22 | 914.083 |
| 3/22/22 | 922.694 |
| 3/23/22 | 915.139 |
| 3/24/22 | 927.864 |
| 3/25/22 | 934.398 |
| 3/27/22 | 933.681 |
| 3/28/22 | 934.019 |
| 3/29/22 | 917.153 |
| 3/30/22 | 899.178 |
| 3/31/22 | 911.36 |
| 4/1/22 | 913.711 |
| 4/3/22 | 909.007 |
| 4/4/22 | 909.11 |
| 4/5/22 | 912.279 |
| 4/6/22 | 909.129 |
| 4/7/22 | 911.232 |
| 4/8/22 | 916.249 |
| 4/10/22 | 923.087 |
| 4/11/22 | 921.762 |
| 4/12/22 | 920.88 |
| 4/13/22 | 921.852 |
| 4/14/22 | 927.767 |
| 4/15/22 | 928.076 |
| 4/17/22 | 928.623 |
| 4/18/22 | 935.051 |
| 4/19/22 | 931.127 |
| 4/20/22 | 918.636 |
| 4/21/22 | 923.147 |
| 4/22/22 | 922.519 |
| 4/24/22 | 915.363 |
| 4/25/22 | 916.427 |
| 4/26/22 | 902.404 |
| 4/27/22 | 907.433 |
| 4/28/22 | 898.126 |
| 4/29/22 | 902.057 |
| 5/1/22 | 905.928 |
| 5/2/22 | 906.54 |
| 5/3/22 | 892.388 |
| 5/4/22 | 889.625 |
| 5/5/22 | 896.745 |
| 5/6/22 | 896.309 |
| 5/8/22 | 905.251 |
| 5/9/22 | 904.155 |
| 5/10/22 | 900.598 |
| 5/11/22 | 903.798 |
| 5/12/22 | 911.672 |
| 5/13/22 | 902.726 |
| 5/15/22 | 902.071 |
| 5/16/22 | 902.611 |
| 5/17/22 | 916.709 |
| 5/18/22 | 929.213 |
| 5/19/22 | 932.429 |
| 5/20/22 | 942.843 |
| 5/22/22 | 945.834 |
| 5/23/22 | 945.775 |
| 5/24/22 | 950.014 |
| 5/25/22 | 967.637 |
| 5/26/22 | 975.974 |
| 5/27/22 | 975.082 |
| 5/29/22 | 975.314 |
| 5/30/22 | 972.581 |
| 5/31/22 | 976.015 |
| 6/1/22 | 968.056 |
| 6/2/22 | 975.205 |
| 6/3/22 | 991.323 |
| 6/5/22 | 981.905 |
| 6/6/22 | 983.3 |
| 6/7/22 | 982.56 |
| 6/8/22 | 1003.803 |
| 6/9/22 | 1023.983 |
| 6/10/22 | 1024.044 |
| 6/12/22 | 1036.268 |
| 6/13/22 | 1040.299 |
| 6/14/22 | 1011.708 |
| 6/15/22 | 1005.794 |
| 6/16/22 | 1015.979 |
| 6/17/22 | 1029.676 |
| 6/19/22 | 1021.449 |
| 6/20/22 | 1025.139 |
| 6/21/22 | 1023.796 |
| 6/22/22 | 1021.462 |
| 6/23/22 | 1024.649 |
| 6/24/22 | 1017.847 |
| 6/26/22 | 990.515 |
| 6/27/22 | 976.282 |
| 6/28/22 | 971.505 |
| 6/29/22 | 972.226 |
| 6/30/22 | 972.95 |
| 7/1/22 | 970.245 |
| 7/3/22 | 976.123 |
| 7/4/22 | 973.709 |
| 7/5/22 | 977.407 |
| 7/6/22 | 968.31 |
| 7/7/22 | 963.05 |
| 7/8/22 | 966.98 |
| 7/10/22 | 967.931 |
| 7/11/22 | 968.483 |
| 7/12/22 | 963.84 |
| 7/13/22 | 959.126 |
| 7/14/22 | 969.995 |
| 7/15/22 | 961.504 |
| 7/17/22 | 948.549 |
| 7/18/22 | 954.522 |
| 7/19/22 | 958.409 |
| 7/20/22 | 964.232 |
| 7/21/22 | 959.588 |
| 7/22/22 | 979.386 |
| 7/24/22 | 987.415 |
| 7/25/22 | 984.763 |
| 7/26/22 | 985.594 |
| 7/27/22 | 987.456 |
| 7/28/22 | 998.591 |
| 7/29/22 | 1012.898 |
| 7/31/22 | 1017.869 |
| 8/1/22 | 1017.16 |
| 8/2/22 | 1019.022 |
| 8/3/22 | 1013.764 |
| 8/4/22 | 1016.656 |
| 8/5/22 | 1034.516 |
| 8/7/22 | 1023.089 |
| 8/8/22 | 1022.817 |
| 8/9/22 | 1032.158 |
| 8/10/22 | 1033.237 |
| 8/11/22 | 1029.956 |
| 8/12/22 | 1032.178 |
| 8/14/22 | 1040.761 |
| 8/15/22 | 1038.157 |
| 8/16/22 | 1026.791 |
| 8/17/22 | 1023.998 |
| 8/18/22 | 1018.781 |
| 8/19/22 | 1022.255 |
| 8/21/22 | 1016.03 |
| 8/22/22 | 1016.102 |
| 8/23/22 | 1009.439 |
| 8/24/22 | 1017.005 |
| 8/25/22 | 1022.176 |
| 8/26/22 | 1026.307 |
| 8/28/22 | 1014.801 |
| 8/29/22 | 1013.816 |
| 8/30/22 | 1017.557 |
| 8/31/22 | 1007.654 |
| 9/1/22 | 999.648 |
| 9/2/22 | 993.866 |
| 9/4/22 | 1002.885 |
| 9/5/22 | 1000.652 |
| 9/6/22 | 1003.83 |
| 9/7/22 | 998.443 |
| 9/8/22 | 1005.829 |
| 9/9/22 | 1003.276 |
| 9/11/22 | 1005.324 |
| 9/12/22 | 1007.925 |
| 9/13/22 | 1011.007 |
| 9/14/22 | 999.049 |
| 9/15/22 | 996.005 |
| 9/16/22 | 976.785 |
| 9/18/22 | 983.231 |
| 9/19/22 | 985.297 |
| 9/20/22 | 985.951 |
| 9/21/22 | 981.455 |
| 9/22/22 | 983.341 |
| 9/23/22 | 985.348 |
| 9/25/22 | 973.71 |
| 9/26/22 | 975.072 |
| 9/27/22 | 966.499 |
| 9/28/22 | 967.062 |
| 9/29/22 | 986.924 |
| 9/30/22 | 991.446 |
| 10/2/22 | 987.713 |
| 10/3/22 | 993.932 |
| 10/4/22 | 1013.665 |
| 10/5/22 | 1029.626 |
| 10/6/22 | 1027.862 |
| 10/7/22 | 1022.651 |
| 10/9/22 | 1012.583 |
| 10/10/22 | 1012.741 |
| 10/11/22 | 997.853 |
| 10/12/22 | 994.941 |
| 10/13/22 | 998.092 |
| 10/14/22 | 992.098 |
| 10/16/22 | 981.928 |
| 10/17/22 | 984.816 |
| 10/18/22 | 986.451 |
| 10/19/22 | 987.324 |
| 10/20/22 | 973 |
| 10/21/22 | 972.482 |
| 10/23/22 | 990.974 |
| 10/24/22 | 993.371 |
| 10/25/22 | 986.569 |
| 10/26/22 | 986.769 |
| 10/27/22 | 997.591 |
| 10/28/22 | 994.473 |
| 10/30/22 | 983.013 |
| 10/31/22 | 984.024 |
| 11/1/22 | 977.369 |
| 11/2/22 | 988.016 |
| 11/3/22 | 978.649 |
| 11/4/22 | 975.819 |
| 11/6/22 | 1005.222 |
| 11/7/22 | 1000.74 |
| 11/8/22 | 993.881 |
| 11/9/22 | 1020.088 |
| 11/10/22 | 1020.478 |
| 11/11/22 | 1042.74 |
| 11/13/22 | 1055.802 |
| 11/14/22 | 1053.55 |
| 11/15/22 | 1057.851 |
| 11/16/22 | 1065.486 |
| 11/17/22 | 1061.864 |
| 11/18/22 | 1055.014 |
| 11/20/22 | 1048.083 |
| 11/21/22 | 1048.946 |
| 11/22/22 | 1040.297 |
| 11/23/22 | 1042.428 |
| 11/24/22 | 1048.855 |
| 11/25/22 | 1051.532 |
| 11/27/22 | 1050.636 |
| 11/28/22 | 1048.137 |
| 11/29/22 | 1042.925 |
| 11/30/22 | 1048.402 |
| 12/1/22 | 1062.582 |
| 12/2/22 | 1080.008 |
| 12/4/22 | 1076.966 |
| 12/5/22 | 1077.795 |
| 12/6/22 | 1059.915 |
| 12/7/22 | 1061.111 |
| 12/8/22 | 1071.111 |
| 12/9/22 | 1072.586 |
| 12/11/22 | 1076.773 |
| 12/12/22 | 1075.89 |
| 12/13/22 | 1066.851 |
| 12/14/22 | 1083.637 |
| 12/15/22 | 1082.592 |
| 12/16/22 | 1065.392 |
| 12/18/22 | 1074.417 |
| 12/19/22 | 1073.597 |
| 12/20/22 | 1071.534 |
| 12/21/22 | 1090.069 |
| 12/22/22 | 1089.026 |
| 12/23/22 | 1077.165 |
| 12/25/22 | 1079.246 |
| 12/26/22 | 1078.563 |
| 12/27/22 | 1081.265 |
| 12/28/22 | 1087.747 |
| 12/29/22 | 1086.635 |
| 12/30/22 | 1092.124 |
| 1/1/23 | 1096.342 |
| 1/2/23 | 1096.071 |
| 1/3/23 | 1102.311 |
| 1/4/23 | 1106.669 |
| 1/5/23 | 1117.961 |
| 1/6/23 | 1106.255 |
| 1/8/23 | 1125.802 |
| 1/9/23 | 1128.796 |
| 1/10/23 | 1128.731 |
| 1/11/23 | 1134.207 |
| 1/12/23 | 1133.283 |
| 1/13/23 | 1146.473 |
| 1/15/23 | 1159.831 |
| 1/16/23 | 1158.008 |
| 1/17/23 | 1158.234 |
| 1/18/23 | 1152.421 |
| 1/19/23 | 1151.666 |
| 1/20/23 | 1167.477 |
| 1/22/23 | 1163.743 |
| 1/23/23 | 1165.489 |
| 1/24/23 | 1165.195 |
| 1/25/23 | 1171.326 |
| 1/26/23 | 1178.207 |
| 1/27/23 | 1167.637 |
| 1/29/23 | 1165.817 |
| 1/30/23 | 1166.809 |
| 1/31/23 | 1162.451 |
| 2/1/23 | 1165.837 |
| 2/2/23 | 1181.524 |
| 2/3/23 | 1158.603 |
| 2/5/23 | 1129.573 |
| 2/6/23 | 1129.78 |
| 2/7/23 | 1131.736 |
| 2/8/23 | 1134.289 |
| 2/9/23 | 1135.528 |
| 2/10/23 | 1128.037 |
| 2/12/23 | 1129.672 |
| 2/13/23 | 1127.945 |
| 2/14/23 | 1123.654 |
| 2/15/23 | 1124.271 |
| 2/16/23 | 1113.387 |
| 2/17/23 | 1112.476 |
| 2/19/23 | 1117.173 |
| 2/20/23 | 1115.194 |
| 2/21/23 | 1117.468 |
| 2/22/23 | 1113.361 |
| 2/23/23 | 1107.915 |
| 2/24/23 | 1106.695 |
| 2/26/23 | 1099.542 |
| 2/27/23 | 1100.277 |
| 2/28/23 | 1103.483 |
| 3/1/23 | 1108.557 |
| 3/2/23 | 1115.352 |
| 3/3/23 | 1116.365 |
| 3/5/23 | 1126.214 |
| 3/6/23 | 1125.865 |
| 3/7/23 | 1121.64 |
| 3/8/23 | 1103.626 |
| 3/9/23 | 1105.784 |
| 3/10/23 | 1116.549 |
| 3/12/23 | 1138.626 |
| 3/13/23 | 1145.458 |
| 3/14/23 | 1166.543 |
| 3/15/23 | 1161.356 |
| 3/16/23 | 1173.199 |
| 3/17/23 | 1174.046 |
| 3/19/23 | 1215.491 |
| 3/20/23 | 1208.67 |
| 3/21/23 | 1208.699 |
| 3/22/23 | 1189.184 |
| 3/23/23 | 1206.366 |
| 3/24/23 | 1220.487 |
| 3/26/23 | 1211.656 |
| 3/27/23 | 1212.348 |
| 3/28/23 | 1202.252 |
| 3/29/23 | 1212.664 |
| 3/30/23 | 1208.996 |
| 3/31/23 | 1220.169 |
| 4/2/23 | 1215.067 |
| 4/3/23 | 1208.177 |
| 4/4/23 | 1225.945 |
| 4/5/23 | 1249.499 |
| 4/6/23 | 1250.729 |
| 4/7/23 | 1243.389 |
| 4/9/23 | 1243.145 |
| 4/10/23 | 1241.908 |
| 4/11/23 | 1234.385 |
| 4/12/23 | 1244.282 |
| 4/13/23 | 1253.724 |
| 4/14/23 | 1268.161 |
| 4/16/23 | 1248.185 |
| 4/17/23 | 1248.305 |
| 4/18/23 | 1243.237 |
| 4/19/23 | 1251.439 |
| 4/20/23 | 1243.815 |
| 4/21/23 | 1251.258 |
| 4/23/23 | 1237.659 |
| 4/24/23 | 1238.582 |
| 4/25/23 | 1244.898 |
| 4/26/23 | 1249.48 |
| 4/27/23 | 1243.99 |
| 4/28/23 | 1242.114 |
| 4/30/23 | 1244.796 |
| 5/1/23 | 1242.845 |
| 5/2/23 | 1239.958 |
| 5/3/23 | 1262.512 |
| 5/4/23 | 1285.327 |
| 5/5/23 | 1284.752 |
| 5/7/23 | 1264.431 |
| 5/8/23 | 1263.968 |
| 5/9/23 | 1267.89 |
| 5/10/23 | 1278.311 |
| 5/11/23 | 1276.647 |
| 5/12/23 | 1268.863 |
| 5/14/23 | 1267.826 |
| 5/15/23 | 1268.357 |
| 5/16/23 | 1275.028 |
| 5/17/23 | 1262.617 |
| 5/18/23 | 1260.617 |
| 5/19/23 | 1247.785 |
| 5/21/23 | 1259.87 |
| 5/22/23 | 1262.751 |
| 5/23/23 | 1258.01 |
| 5/24/23 | 1261.824 |
| 5/25/23 | 1254.657 |
| 5/26/23 | 1251.162 |
| 5/28/23 | 1249.947 |
| 5/29/23 | 1251.61 |
| 5/30/23 | 1257.933 |
| 5/31/23 | 1297.936 |
| 6/1/23 | 1312.416 |
| 6/2/23 | 1328.323 |
| 6/4/23 | 1312.9 |
| 6/5/23 | 1321.464 |
| 6/6/23 | 1341.418 |
| 6/7/23 | 1384.936 |
| 6/8/23 | 1456.683 |
| 6/9/23 | 1485.173 |
| 6/11/23 | 1475.158 |
| 6/12/23 | 1490.297 |
| 6/13/23 | 1491.32 |
| 6/14/23 | 1474.281 |
| 6/15/23 | 1473.82 |
| 6/16/23 | 1489.666 |
| 6/18/23 | 1486.631 |
| 6/19/23 | 1480.66 |
| 6/20/23 | 1481.292 |
| 6/21/23 | 1469.28 |
| 6/22/23 | 1465.42 |
| 6/23/23 | 1534.079 |
| 6/25/23 | 1558.718 |
| 6/26/23 | 1567.709 |
| 6/27/23 | 1612.834 |
| 6/28/23 | 1602.252 |
| 6/29/23 | 1599.947 |
| 6/30/23 | 1597.389 |
| 7/2/23 | 1607.639 |
| 7/3/23 | 1584.926 |
| 7/4/23 | 1600.303 |
| 7/5/23 | 1607.366 |
| 7/6/23 | 1611.653 |
| 7/7/23 | 1604.845 |
| 7/9/23 | 1613.047 |
| 7/10/23 | 1620.731 |
| 7/11/23 | 1619.73 |
| 7/12/23 | 1623.24 |
| 7/13/23 | 1648.947 |
| 7/14/23 | 1643.421 |
| 7/16/23 | 1646.756 |
| 7/17/23 | 1650.743 |
| 7/18/23 | 1660.595 |
| 7/19/23 | 1713.905 |
| 7/20/23 | 1713.637 |
| 7/21/23 | 1702.287 |
| 7/23/23 | 1701.24 |
| 7/24/23 | 1700.383 |
| 7/25/23 | 1698.287 |
| 7/26/23 | 1699.799 |
| 7/27/23 | 1706.264 |
| 7/28/23 | 1688.68 |
| 7/30/23 | 1694.942 |
| 7/31/23 | 1694.845 |
| 8/1/23 | 1700.753 |
| 8/2/23 | 1693.867 |
| 8/3/23 | 1678.835 |
| 8/4/23 | 1682.064 |
| 8/6/23 | 1680.981 |
| 8/7/23 | 1687.112 |
| 8/8/23 | 1682.175 |
| 8/9/23 | 1675.224 |
| 8/10/23 | 1664.201 |
| 8/11/23 | 1667.583 |
| 8/13/23 | 1664.075 |
| 8/14/23 | 1668.464 |
| 8/15/23 | 1660.156 |
| 8/16/23 | 1655.216 |
| 8/17/23 | 1649.474 |
| 8/18/23 | 1649.572 |
| 8/20/23 | 1646.699 |
| 8/21/23 | 1648.772 |
| 8/22/23 | 1658.084 |
| 8/23/23 | 1661.499 |
| 8/24/23 | 1679.95 |
| 8/25/23 | 1595.399 |
| 8/27/23 | 1634.754 |
| 8/28/23 | 1622.744 |
| 8/29/23 | 1625.41 |
| 8/30/23 | 1652.733 |
| 8/31/23 | 1668.486 |
| 9/1/23 | 1665.583 |
| 9/3/23 | 1667.261 |
| 9/4/23 | 1658.719 |
| 9/5/23 | 1668.274 |
| 9/6/23 | 1659.063 |
| 9/7/23 | 1654.054 |
| 9/8/23 | 1657.945 |
| 9/10/23 | 1656.847 |
| 9/11/23 | 1654.442 |
| 9/12/23 | 1661.558 |
| 9/13/23 | 1656.186 |
| 9/14/23 | 1650.703 |
| 9/15/23 | 1655.222 |
| 9/17/23 | 1669.938 |
| 9/18/23 | 1666.963 |
| 9/19/23 | 1678.823 |
| 9/20/23 | 1678.246 |
| 9/21/23 | 1676.204 |
| 9/22/23 | 1675.409 |
| 9/24/23 | 1682.147 |
| 9/25/23 | 1682.904 |
| 9/26/23 | 1677.356 |
| 9/27/23 | 1672.065 |
| 9/28/23 | 1650.482 |
| 9/29/23 | 1648.292 |
| 10/1/23 | 1630.008 |
| 10/2/23 | 1632.901 |
| 10/3/23 | 1614.644 |
| 10/4/23 | 1614.88 |
| 10/5/23 | 1615.567 |
| 10/6/23 | 1615.372 |
| 10/8/23 | 1629.733 |
| 10/9/23 | 1646.276 |
| 10/10/23 | 1660.696 |
| 10/11/23 | 1658.528 |
| 10/12/23 | 1671.653 |
| 10/13/23 | 1673.661 |
| 10/15/23 | 1728.325 |
| 10/16/23 | 1715.381 |
| 10/17/23 | 1720.283 |
| 10/18/23 | 1730.731 |
| 10/19/23 | 1759.303 |
| 10/20/23 | 1781.96 |
| 10/22/23 | 1784.657 |
| 10/23/23 | 1778.372 |
| 10/24/23 | 1782.412 |
| 10/25/23 | 1785.13 |
| 10/26/23 | 1794.984 |
| 10/27/23 | 1797.443 |
| 10/29/23 | 1820.966 |
| 10/30/23 | 1820.866 |
| 10/31/23 | 1813.716 |
| 11/1/23 | 1805.505 |
| 11/2/23 | 1808.247 |
| 11/3/23 | 1814.164 |
| 11/5/23 | 1810.449 |
| 11/6/23 | 1816.9 |
| 11/7/23 | 1808.57 |
| 11/8/23 | 1804.769 |
| 11/9/23 | 1789.385 |
| 11/10/23 | 1798.077 |
| 11/12/23 | 1775.739 |
| 11/13/23 | 1779.396 |
| 11/14/23 | 1790.856 |
| 11/15/23 | 1809.534 |
| 11/16/23 | 1807.981 |